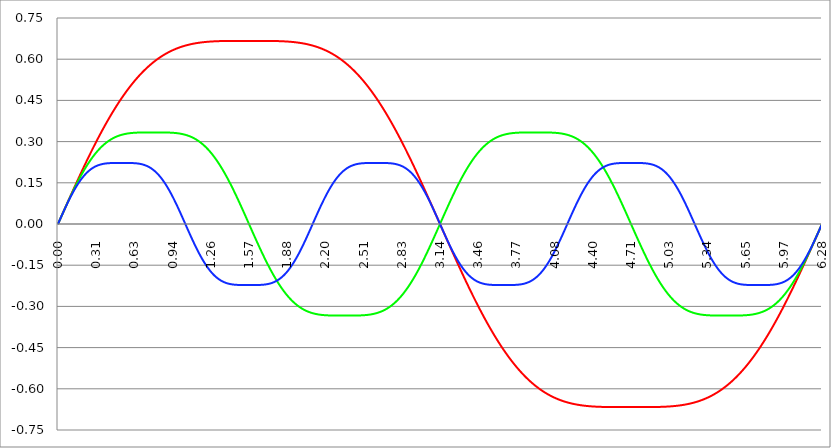
| Category | Series 1 | Series 0 | Series 2 |
|---|---|---|---|
| 0.0 | 0 | 0 | 0 |
| 0.00314159265358979 | 0.003 | 0.003 | 0.003 |
| 0.00628318530717958 | 0.006 | 0.006 | 0.006 |
| 0.00942477796076938 | 0.009 | 0.009 | 0.009 |
| 0.0125663706143592 | 0.013 | 0.013 | 0.013 |
| 0.015707963267949 | 0.016 | 0.016 | 0.016 |
| 0.0188495559215388 | 0.019 | 0.019 | 0.019 |
| 0.0219911485751285 | 0.022 | 0.022 | 0.022 |
| 0.0251327412287183 | 0.025 | 0.025 | 0.025 |
| 0.0282743338823081 | 0.028 | 0.028 | 0.028 |
| 0.0314159265358979 | 0.031 | 0.031 | 0.031 |
| 0.0345575191894877 | 0.035 | 0.034 | 0.034 |
| 0.0376991118430775 | 0.038 | 0.038 | 0.037 |
| 0.0408407044966673 | 0.041 | 0.041 | 0.041 |
| 0.0439822971502571 | 0.044 | 0.044 | 0.044 |
| 0.0471238898038469 | 0.047 | 0.047 | 0.047 |
| 0.0502654824574367 | 0.05 | 0.05 | 0.05 |
| 0.0534070751110265 | 0.053 | 0.053 | 0.053 |
| 0.0565486677646163 | 0.056 | 0.056 | 0.056 |
| 0.059690260418206 | 0.06 | 0.059 | 0.059 |
| 0.0628318530717958 | 0.063 | 0.062 | 0.062 |
| 0.0659734457253856 | 0.066 | 0.065 | 0.065 |
| 0.0691150383789754 | 0.069 | 0.068 | 0.068 |
| 0.0722566310325652 | 0.072 | 0.072 | 0.071 |
| 0.075398223686155 | 0.075 | 0.075 | 0.074 |
| 0.0785398163397448 | 0.078 | 0.078 | 0.076 |
| 0.0816814089933346 | 0.081 | 0.081 | 0.079 |
| 0.0848230016469244 | 0.085 | 0.084 | 0.082 |
| 0.0879645943005142 | 0.088 | 0.087 | 0.085 |
| 0.091106186954104 | 0.091 | 0.09 | 0.088 |
| 0.0942477796076937 | 0.094 | 0.093 | 0.091 |
| 0.0973893722612835 | 0.097 | 0.096 | 0.093 |
| 0.100530964914873 | 0.1 | 0.099 | 0.096 |
| 0.103672557568463 | 0.103 | 0.101 | 0.099 |
| 0.106814150222053 | 0.106 | 0.104 | 0.102 |
| 0.109955742875643 | 0.109 | 0.107 | 0.104 |
| 0.113097335529233 | 0.112 | 0.11 | 0.107 |
| 0.116238928182822 | 0.115 | 0.113 | 0.109 |
| 0.119380520836412 | 0.119 | 0.116 | 0.112 |
| 0.122522113490002 | 0.122 | 0.119 | 0.115 |
| 0.125663706143592 | 0.125 | 0.122 | 0.117 |
| 0.128805298797181 | 0.128 | 0.125 | 0.12 |
| 0.131946891450771 | 0.131 | 0.127 | 0.122 |
| 0.135088484104361 | 0.134 | 0.13 | 0.125 |
| 0.138230076757951 | 0.137 | 0.133 | 0.127 |
| 0.141371669411541 | 0.14 | 0.136 | 0.129 |
| 0.14451326206513 | 0.143 | 0.139 | 0.132 |
| 0.14765485471872 | 0.146 | 0.141 | 0.134 |
| 0.15079644737231 | 0.149 | 0.144 | 0.136 |
| 0.1539380400259 | 0.152 | 0.147 | 0.139 |
| 0.15707963267949 | 0.155 | 0.15 | 0.141 |
| 0.160221225333079 | 0.158 | 0.152 | 0.143 |
| 0.163362817986669 | 0.161 | 0.155 | 0.145 |
| 0.166504410640259 | 0.164 | 0.158 | 0.147 |
| 0.169646003293849 | 0.167 | 0.16 | 0.15 |
| 0.172787595947439 | 0.17 | 0.163 | 0.152 |
| 0.175929188601028 | 0.173 | 0.165 | 0.154 |
| 0.179070781254618 | 0.176 | 0.168 | 0.156 |
| 0.182212373908208 | 0.179 | 0.171 | 0.158 |
| 0.185353966561798 | 0.182 | 0.173 | 0.16 |
| 0.188495559215388 | 0.185 | 0.176 | 0.162 |
| 0.191637151868977 | 0.188 | 0.178 | 0.163 |
| 0.194778744522567 | 0.191 | 0.181 | 0.165 |
| 0.197920337176157 | 0.194 | 0.183 | 0.167 |
| 0.201061929829747 | 0.197 | 0.186 | 0.169 |
| 0.204203522483336 | 0.2 | 0.188 | 0.171 |
| 0.207345115136926 | 0.203 | 0.191 | 0.172 |
| 0.210486707790516 | 0.206 | 0.193 | 0.174 |
| 0.213628300444106 | 0.209 | 0.195 | 0.176 |
| 0.216769893097696 | 0.212 | 0.198 | 0.177 |
| 0.219911485751285 | 0.215 | 0.2 | 0.179 |
| 0.223053078404875 | 0.218 | 0.202 | 0.18 |
| 0.226194671058465 | 0.221 | 0.205 | 0.182 |
| 0.229336263712055 | 0.223 | 0.207 | 0.183 |
| 0.232477856365645 | 0.226 | 0.209 | 0.185 |
| 0.235619449019234 | 0.229 | 0.211 | 0.186 |
| 0.238761041672824 | 0.232 | 0.214 | 0.187 |
| 0.241902634326414 | 0.235 | 0.216 | 0.189 |
| 0.245044226980004 | 0.238 | 0.218 | 0.19 |
| 0.248185819633594 | 0.241 | 0.22 | 0.191 |
| 0.251327412287183 | 0.244 | 0.222 | 0.193 |
| 0.254469004940773 | 0.246 | 0.224 | 0.194 |
| 0.257610597594363 | 0.249 | 0.226 | 0.195 |
| 0.260752190247953 | 0.252 | 0.228 | 0.196 |
| 0.263893782901543 | 0.255 | 0.231 | 0.197 |
| 0.267035375555132 | 0.258 | 0.233 | 0.198 |
| 0.270176968208722 | 0.261 | 0.235 | 0.199 |
| 0.273318560862312 | 0.263 | 0.236 | 0.2 |
| 0.276460153515902 | 0.266 | 0.238 | 0.201 |
| 0.279601746169492 | 0.269 | 0.24 | 0.202 |
| 0.282743338823082 | 0.272 | 0.242 | 0.203 |
| 0.285884931476671 | 0.275 | 0.244 | 0.204 |
| 0.289026524130261 | 0.277 | 0.246 | 0.205 |
| 0.292168116783851 | 0.28 | 0.248 | 0.206 |
| 0.295309709437441 | 0.283 | 0.25 | 0.207 |
| 0.298451302091031 | 0.286 | 0.251 | 0.207 |
| 0.30159289474462 | 0.288 | 0.253 | 0.208 |
| 0.30473448739821 | 0.291 | 0.255 | 0.209 |
| 0.3078760800518 | 0.294 | 0.257 | 0.21 |
| 0.31101767270539 | 0.296 | 0.258 | 0.21 |
| 0.31415926535898 | 0.299 | 0.26 | 0.211 |
| 0.31730085801257 | 0.302 | 0.262 | 0.211 |
| 0.320442450666159 | 0.305 | 0.263 | 0.212 |
| 0.323584043319749 | 0.307 | 0.265 | 0.213 |
| 0.326725635973339 | 0.31 | 0.267 | 0.213 |
| 0.329867228626929 | 0.313 | 0.268 | 0.214 |
| 0.333008821280519 | 0.315 | 0.27 | 0.214 |
| 0.336150413934108 | 0.318 | 0.271 | 0.215 |
| 0.339292006587698 | 0.321 | 0.273 | 0.215 |
| 0.342433599241288 | 0.323 | 0.274 | 0.216 |
| 0.345575191894878 | 0.326 | 0.276 | 0.216 |
| 0.348716784548468 | 0.328 | 0.277 | 0.216 |
| 0.351858377202058 | 0.331 | 0.278 | 0.217 |
| 0.354999969855647 | 0.334 | 0.28 | 0.217 |
| 0.358141562509237 | 0.336 | 0.281 | 0.218 |
| 0.361283155162827 | 0.339 | 0.282 | 0.218 |
| 0.364424747816417 | 0.341 | 0.284 | 0.218 |
| 0.367566340470007 | 0.344 | 0.285 | 0.219 |
| 0.370707933123597 | 0.346 | 0.286 | 0.219 |
| 0.373849525777186 | 0.349 | 0.288 | 0.219 |
| 0.376991118430776 | 0.351 | 0.289 | 0.219 |
| 0.380132711084366 | 0.354 | 0.29 | 0.22 |
| 0.383274303737956 | 0.357 | 0.291 | 0.22 |
| 0.386415896391546 | 0.359 | 0.292 | 0.22 |
| 0.389557489045135 | 0.362 | 0.294 | 0.22 |
| 0.392699081698725 | 0.364 | 0.295 | 0.22 |
| 0.395840674352315 | 0.366 | 0.296 | 0.221 |
| 0.398982267005905 | 0.369 | 0.297 | 0.221 |
| 0.402123859659495 | 0.371 | 0.298 | 0.221 |
| 0.405265452313085 | 0.374 | 0.299 | 0.221 |
| 0.408407044966674 | 0.376 | 0.3 | 0.221 |
| 0.411548637620264 | 0.379 | 0.301 | 0.221 |
| 0.414690230273854 | 0.381 | 0.302 | 0.221 |
| 0.417831822927444 | 0.384 | 0.303 | 0.221 |
| 0.420973415581034 | 0.386 | 0.304 | 0.221 |
| 0.424115008234623 | 0.388 | 0.305 | 0.222 |
| 0.427256600888213 | 0.391 | 0.306 | 0.222 |
| 0.430398193541803 | 0.393 | 0.306 | 0.222 |
| 0.433539786195393 | 0.395 | 0.307 | 0.222 |
| 0.436681378848983 | 0.398 | 0.308 | 0.222 |
| 0.439822971502573 | 0.4 | 0.309 | 0.222 |
| 0.442964564156162 | 0.402 | 0.31 | 0.222 |
| 0.446106156809752 | 0.405 | 0.311 | 0.222 |
| 0.449247749463342 | 0.407 | 0.311 | 0.222 |
| 0.452389342116932 | 0.409 | 0.312 | 0.222 |
| 0.455530934770522 | 0.412 | 0.313 | 0.222 |
| 0.458672527424111 | 0.414 | 0.314 | 0.222 |
| 0.461814120077701 | 0.416 | 0.314 | 0.222 |
| 0.464955712731291 | 0.418 | 0.315 | 0.222 |
| 0.468097305384881 | 0.421 | 0.316 | 0.222 |
| 0.471238898038471 | 0.423 | 0.316 | 0.222 |
| 0.474380490692061 | 0.425 | 0.317 | 0.222 |
| 0.47752208334565 | 0.427 | 0.318 | 0.222 |
| 0.48066367599924 | 0.429 | 0.318 | 0.222 |
| 0.48380526865283 | 0.432 | 0.319 | 0.222 |
| 0.48694686130642 | 0.434 | 0.319 | 0.222 |
| 0.49008845396001 | 0.436 | 0.32 | 0.222 |
| 0.493230046613599 | 0.438 | 0.32 | 0.222 |
| 0.496371639267189 | 0.44 | 0.321 | 0.222 |
| 0.499513231920779 | 0.442 | 0.321 | 0.222 |
| 0.502654824574369 | 0.444 | 0.322 | 0.222 |
| 0.505796417227959 | 0.447 | 0.322 | 0.222 |
| 0.508938009881549 | 0.449 | 0.323 | 0.222 |
| 0.512079602535138 | 0.451 | 0.323 | 0.222 |
| 0.515221195188728 | 0.453 | 0.324 | 0.222 |
| 0.518362787842318 | 0.455 | 0.324 | 0.222 |
| 0.521504380495908 | 0.457 | 0.324 | 0.222 |
| 0.524645973149498 | 0.459 | 0.325 | 0.222 |
| 0.527787565803087 | 0.461 | 0.325 | 0.222 |
| 0.530929158456677 | 0.463 | 0.326 | 0.222 |
| 0.534070751110267 | 0.465 | 0.326 | 0.222 |
| 0.537212343763857 | 0.467 | 0.326 | 0.222 |
| 0.540353936417447 | 0.469 | 0.327 | 0.222 |
| 0.543495529071037 | 0.471 | 0.327 | 0.222 |
| 0.546637121724626 | 0.473 | 0.327 | 0.222 |
| 0.549778714378216 | 0.475 | 0.328 | 0.222 |
| 0.552920307031806 | 0.477 | 0.328 | 0.222 |
| 0.556061899685396 | 0.479 | 0.328 | 0.222 |
| 0.559203492338986 | 0.481 | 0.328 | 0.222 |
| 0.562345084992576 | 0.483 | 0.329 | 0.222 |
| 0.565486677646165 | 0.485 | 0.329 | 0.222 |
| 0.568628270299755 | 0.486 | 0.329 | 0.222 |
| 0.571769862953345 | 0.488 | 0.329 | 0.222 |
| 0.574911455606935 | 0.49 | 0.33 | 0.222 |
| 0.578053048260525 | 0.492 | 0.33 | 0.222 |
| 0.581194640914114 | 0.494 | 0.33 | 0.222 |
| 0.584336233567704 | 0.496 | 0.33 | 0.222 |
| 0.587477826221294 | 0.498 | 0.33 | 0.222 |
| 0.590619418874884 | 0.499 | 0.331 | 0.222 |
| 0.593761011528474 | 0.501 | 0.331 | 0.222 |
| 0.596902604182064 | 0.503 | 0.331 | 0.222 |
| 0.600044196835653 | 0.505 | 0.331 | 0.222 |
| 0.603185789489243 | 0.506 | 0.331 | 0.222 |
| 0.606327382142833 | 0.508 | 0.331 | 0.222 |
| 0.609468974796423 | 0.51 | 0.331 | 0.222 |
| 0.612610567450013 | 0.512 | 0.332 | 0.222 |
| 0.615752160103602 | 0.513 | 0.332 | 0.222 |
| 0.618893752757192 | 0.515 | 0.332 | 0.222 |
| 0.622035345410782 | 0.517 | 0.332 | 0.222 |
| 0.625176938064372 | 0.518 | 0.332 | 0.222 |
| 0.628318530717962 | 0.52 | 0.332 | 0.221 |
| 0.631460123371551 | 0.522 | 0.332 | 0.221 |
| 0.634601716025141 | 0.523 | 0.332 | 0.221 |
| 0.637743308678731 | 0.525 | 0.332 | 0.221 |
| 0.640884901332321 | 0.527 | 0.332 | 0.221 |
| 0.644026493985911 | 0.528 | 0.333 | 0.221 |
| 0.647168086639501 | 0.53 | 0.333 | 0.221 |
| 0.65030967929309 | 0.531 | 0.333 | 0.221 |
| 0.65345127194668 | 0.533 | 0.333 | 0.22 |
| 0.65659286460027 | 0.535 | 0.333 | 0.22 |
| 0.65973445725386 | 0.536 | 0.333 | 0.22 |
| 0.66287604990745 | 0.538 | 0.333 | 0.22 |
| 0.666017642561039 | 0.539 | 0.333 | 0.22 |
| 0.669159235214629 | 0.541 | 0.333 | 0.219 |
| 0.672300827868219 | 0.542 | 0.333 | 0.219 |
| 0.675442420521809 | 0.544 | 0.333 | 0.219 |
| 0.678584013175399 | 0.545 | 0.333 | 0.219 |
| 0.681725605828989 | 0.547 | 0.333 | 0.218 |
| 0.684867198482578 | 0.548 | 0.333 | 0.218 |
| 0.688008791136168 | 0.55 | 0.333 | 0.218 |
| 0.691150383789758 | 0.551 | 0.333 | 0.217 |
| 0.694291976443348 | 0.553 | 0.333 | 0.217 |
| 0.697433569096938 | 0.554 | 0.333 | 0.217 |
| 0.700575161750528 | 0.555 | 0.333 | 0.216 |
| 0.703716754404117 | 0.557 | 0.333 | 0.216 |
| 0.706858347057707 | 0.558 | 0.333 | 0.215 |
| 0.709999939711297 | 0.56 | 0.333 | 0.215 |
| 0.713141532364887 | 0.561 | 0.333 | 0.214 |
| 0.716283125018477 | 0.562 | 0.333 | 0.214 |
| 0.719424717672066 | 0.564 | 0.333 | 0.213 |
| 0.722566310325656 | 0.565 | 0.333 | 0.213 |
| 0.725707902979246 | 0.566 | 0.333 | 0.212 |
| 0.728849495632836 | 0.568 | 0.333 | 0.212 |
| 0.731991088286426 | 0.569 | 0.333 | 0.211 |
| 0.735132680940016 | 0.57 | 0.333 | 0.21 |
| 0.738274273593605 | 0.571 | 0.333 | 0.21 |
| 0.741415866247195 | 0.573 | 0.333 | 0.209 |
| 0.744557458900785 | 0.574 | 0.333 | 0.208 |
| 0.747699051554375 | 0.575 | 0.333 | 0.208 |
| 0.750840644207965 | 0.576 | 0.333 | 0.207 |
| 0.753982236861554 | 0.578 | 0.333 | 0.206 |
| 0.757123829515144 | 0.579 | 0.333 | 0.205 |
| 0.760265422168734 | 0.58 | 0.333 | 0.204 |
| 0.763407014822324 | 0.581 | 0.333 | 0.203 |
| 0.766548607475914 | 0.582 | 0.333 | 0.203 |
| 0.769690200129504 | 0.584 | 0.333 | 0.202 |
| 0.772831792783093 | 0.585 | 0.333 | 0.201 |
| 0.775973385436683 | 0.586 | 0.333 | 0.2 |
| 0.779114978090273 | 0.587 | 0.333 | 0.199 |
| 0.782256570743863 | 0.588 | 0.333 | 0.198 |
| 0.785398163397453 | 0.589 | 0.333 | 0.196 |
| 0.788539756051042 | 0.59 | 0.333 | 0.195 |
| 0.791681348704632 | 0.591 | 0.333 | 0.194 |
| 0.794822941358222 | 0.593 | 0.333 | 0.193 |
| 0.797964534011812 | 0.594 | 0.333 | 0.192 |
| 0.801106126665402 | 0.595 | 0.333 | 0.19 |
| 0.804247719318992 | 0.596 | 0.333 | 0.189 |
| 0.807389311972581 | 0.597 | 0.333 | 0.188 |
| 0.810530904626171 | 0.598 | 0.333 | 0.187 |
| 0.813672497279761 | 0.599 | 0.333 | 0.185 |
| 0.816814089933351 | 0.6 | 0.333 | 0.184 |
| 0.819955682586941 | 0.601 | 0.333 | 0.182 |
| 0.823097275240531 | 0.602 | 0.333 | 0.181 |
| 0.82623886789412 | 0.603 | 0.333 | 0.179 |
| 0.82938046054771 | 0.604 | 0.333 | 0.178 |
| 0.8325220532013 | 0.605 | 0.333 | 0.176 |
| 0.83566364585489 | 0.606 | 0.333 | 0.174 |
| 0.83880523850848 | 0.607 | 0.333 | 0.173 |
| 0.841946831162069 | 0.608 | 0.333 | 0.171 |
| 0.845088423815659 | 0.609 | 0.333 | 0.169 |
| 0.848230016469249 | 0.609 | 0.333 | 0.168 |
| 0.851371609122839 | 0.61 | 0.333 | 0.166 |
| 0.854513201776429 | 0.611 | 0.333 | 0.164 |
| 0.857654794430019 | 0.612 | 0.333 | 0.162 |
| 0.860796387083608 | 0.613 | 0.333 | 0.16 |
| 0.863937979737198 | 0.614 | 0.333 | 0.158 |
| 0.867079572390788 | 0.615 | 0.333 | 0.156 |
| 0.870221165044378 | 0.616 | 0.333 | 0.154 |
| 0.873362757697968 | 0.616 | 0.333 | 0.152 |
| 0.876504350351557 | 0.617 | 0.333 | 0.15 |
| 0.879645943005147 | 0.618 | 0.333 | 0.148 |
| 0.882787535658737 | 0.619 | 0.333 | 0.146 |
| 0.885929128312327 | 0.62 | 0.333 | 0.144 |
| 0.889070720965917 | 0.62 | 0.333 | 0.142 |
| 0.892212313619507 | 0.621 | 0.333 | 0.139 |
| 0.895353906273096 | 0.622 | 0.333 | 0.137 |
| 0.898495498926686 | 0.623 | 0.333 | 0.135 |
| 0.901637091580276 | 0.624 | 0.333 | 0.133 |
| 0.904778684233866 | 0.624 | 0.333 | 0.13 |
| 0.907920276887456 | 0.625 | 0.333 | 0.128 |
| 0.911061869541045 | 0.626 | 0.333 | 0.125 |
| 0.914203462194635 | 0.626 | 0.333 | 0.123 |
| 0.917345054848225 | 0.627 | 0.333 | 0.121 |
| 0.920486647501815 | 0.628 | 0.333 | 0.118 |
| 0.923628240155405 | 0.629 | 0.333 | 0.115 |
| 0.926769832808995 | 0.629 | 0.333 | 0.113 |
| 0.929911425462584 | 0.63 | 0.332 | 0.11 |
| 0.933053018116174 | 0.631 | 0.332 | 0.108 |
| 0.936194610769764 | 0.631 | 0.332 | 0.105 |
| 0.939336203423354 | 0.632 | 0.332 | 0.102 |
| 0.942477796076944 | 0.633 | 0.332 | 0.1 |
| 0.945619388730533 | 0.633 | 0.332 | 0.097 |
| 0.948760981384123 | 0.634 | 0.332 | 0.094 |
| 0.951902574037713 | 0.634 | 0.332 | 0.092 |
| 0.955044166691303 | 0.635 | 0.332 | 0.089 |
| 0.958185759344893 | 0.636 | 0.332 | 0.086 |
| 0.961327351998483 | 0.636 | 0.331 | 0.083 |
| 0.964468944652072 | 0.637 | 0.331 | 0.08 |
| 0.967610537305662 | 0.637 | 0.331 | 0.077 |
| 0.970752129959252 | 0.638 | 0.331 | 0.074 |
| 0.973893722612842 | 0.638 | 0.331 | 0.072 |
| 0.977035315266432 | 0.639 | 0.331 | 0.069 |
| 0.980176907920022 | 0.64 | 0.331 | 0.066 |
| 0.983318500573611 | 0.64 | 0.33 | 0.063 |
| 0.986460093227201 | 0.641 | 0.33 | 0.06 |
| 0.989601685880791 | 0.641 | 0.33 | 0.057 |
| 0.992743278534381 | 0.642 | 0.33 | 0.054 |
| 0.995884871187971 | 0.642 | 0.33 | 0.051 |
| 0.99902646384156 | 0.643 | 0.329 | 0.048 |
| 1.00216805649515 | 0.643 | 0.329 | 0.045 |
| 1.00530964914874 | 0.644 | 0.329 | 0.042 |
| 1.00845124180233 | 0.644 | 0.329 | 0.038 |
| 1.01159283445592 | 0.645 | 0.328 | 0.035 |
| 1.01473442710951 | 0.645 | 0.328 | 0.032 |
| 1.017876019763099 | 0.646 | 0.328 | 0.029 |
| 1.021017612416689 | 0.646 | 0.328 | 0.026 |
| 1.02415920507028 | 0.646 | 0.327 | 0.023 |
| 1.027300797723869 | 0.647 | 0.327 | 0.02 |
| 1.030442390377459 | 0.647 | 0.327 | 0.017 |
| 1.033583983031048 | 0.648 | 0.326 | 0.014 |
| 1.036725575684638 | 0.648 | 0.326 | 0.01 |
| 1.039867168338228 | 0.649 | 0.326 | 0.007 |
| 1.043008760991818 | 0.649 | 0.325 | 0.004 |
| 1.046150353645408 | 0.649 | 0.325 | 0.001 |
| 1.049291946298998 | 0.65 | 0.324 | -0.002 |
| 1.052433538952587 | 0.65 | 0.324 | -0.005 |
| 1.055575131606177 | 0.651 | 0.324 | -0.008 |
| 1.058716724259767 | 0.651 | 0.323 | -0.012 |
| 1.061858316913357 | 0.651 | 0.323 | -0.015 |
| 1.064999909566947 | 0.652 | 0.322 | -0.018 |
| 1.068141502220536 | 0.652 | 0.322 | -0.021 |
| 1.071283094874126 | 0.652 | 0.321 | -0.024 |
| 1.074424687527716 | 0.653 | 0.321 | -0.027 |
| 1.077566280181306 | 0.653 | 0.32 | -0.03 |
| 1.080707872834896 | 0.653 | 0.32 | -0.033 |
| 1.083849465488486 | 0.654 | 0.319 | -0.036 |
| 1.086991058142075 | 0.654 | 0.319 | -0.04 |
| 1.090132650795665 | 0.654 | 0.318 | -0.043 |
| 1.093274243449255 | 0.655 | 0.318 | -0.046 |
| 1.096415836102845 | 0.655 | 0.317 | -0.049 |
| 1.099557428756435 | 0.655 | 0.316 | -0.052 |
| 1.102699021410025 | 0.656 | 0.316 | -0.055 |
| 1.105840614063614 | 0.656 | 0.315 | -0.058 |
| 1.108982206717204 | 0.656 | 0.314 | -0.061 |
| 1.112123799370794 | 0.656 | 0.314 | -0.064 |
| 1.115265392024384 | 0.657 | 0.313 | -0.067 |
| 1.118406984677974 | 0.657 | 0.312 | -0.07 |
| 1.121548577331563 | 0.657 | 0.311 | -0.073 |
| 1.124690169985153 | 0.657 | 0.311 | -0.075 |
| 1.127831762638743 | 0.658 | 0.31 | -0.078 |
| 1.130973355292333 | 0.658 | 0.309 | -0.081 |
| 1.134114947945923 | 0.658 | 0.308 | -0.084 |
| 1.137256540599513 | 0.658 | 0.307 | -0.087 |
| 1.140398133253102 | 0.659 | 0.306 | -0.09 |
| 1.143539725906692 | 0.659 | 0.306 | -0.092 |
| 1.146681318560282 | 0.659 | 0.305 | -0.095 |
| 1.149822911213872 | 0.659 | 0.304 | -0.098 |
| 1.152964503867462 | 0.659 | 0.303 | -0.101 |
| 1.156106096521051 | 0.66 | 0.302 | -0.103 |
| 1.159247689174641 | 0.66 | 0.301 | -0.106 |
| 1.162389281828231 | 0.66 | 0.3 | -0.109 |
| 1.165530874481821 | 0.66 | 0.299 | -0.111 |
| 1.168672467135411 | 0.66 | 0.298 | -0.114 |
| 1.171814059789001 | 0.661 | 0.297 | -0.116 |
| 1.17495565244259 | 0.661 | 0.296 | -0.119 |
| 1.17809724509618 | 0.661 | 0.295 | -0.121 |
| 1.18123883774977 | 0.661 | 0.294 | -0.124 |
| 1.18438043040336 | 0.661 | 0.292 | -0.126 |
| 1.18752202305695 | 0.662 | 0.291 | -0.129 |
| 1.190663615710539 | 0.662 | 0.29 | -0.131 |
| 1.193805208364129 | 0.662 | 0.289 | -0.133 |
| 1.19694680101772 | 0.662 | 0.288 | -0.136 |
| 1.200088393671309 | 0.662 | 0.286 | -0.138 |
| 1.203229986324899 | 0.662 | 0.285 | -0.14 |
| 1.206371578978489 | 0.662 | 0.284 | -0.142 |
| 1.209513171632078 | 0.663 | 0.282 | -0.145 |
| 1.212654764285668 | 0.663 | 0.281 | -0.147 |
| 1.215796356939258 | 0.663 | 0.28 | -0.149 |
| 1.218937949592848 | 0.663 | 0.278 | -0.151 |
| 1.222079542246438 | 0.663 | 0.277 | -0.153 |
| 1.225221134900027 | 0.663 | 0.276 | -0.155 |
| 1.228362727553617 | 0.663 | 0.274 | -0.157 |
| 1.231504320207207 | 0.663 | 0.273 | -0.159 |
| 1.234645912860797 | 0.664 | 0.271 | -0.161 |
| 1.237787505514387 | 0.664 | 0.27 | -0.163 |
| 1.240929098167977 | 0.664 | 0.268 | -0.165 |
| 1.244070690821566 | 0.664 | 0.267 | -0.166 |
| 1.247212283475156 | 0.664 | 0.265 | -0.168 |
| 1.250353876128746 | 0.664 | 0.263 | -0.17 |
| 1.253495468782336 | 0.664 | 0.262 | -0.172 |
| 1.256637061435926 | 0.664 | 0.26 | -0.173 |
| 1.259778654089515 | 0.664 | 0.258 | -0.175 |
| 1.262920246743105 | 0.664 | 0.257 | -0.177 |
| 1.266061839396695 | 0.665 | 0.255 | -0.178 |
| 1.269203432050285 | 0.665 | 0.253 | -0.18 |
| 1.272345024703875 | 0.665 | 0.251 | -0.181 |
| 1.275486617357465 | 0.665 | 0.25 | -0.183 |
| 1.278628210011054 | 0.665 | 0.248 | -0.184 |
| 1.281769802664644 | 0.665 | 0.246 | -0.186 |
| 1.284911395318234 | 0.665 | 0.244 | -0.187 |
| 1.288052987971824 | 0.665 | 0.242 | -0.188 |
| 1.291194580625414 | 0.665 | 0.24 | -0.19 |
| 1.294336173279003 | 0.665 | 0.238 | -0.191 |
| 1.297477765932593 | 0.665 | 0.236 | -0.192 |
| 1.300619358586183 | 0.665 | 0.235 | -0.193 |
| 1.303760951239773 | 0.665 | 0.233 | -0.195 |
| 1.306902543893363 | 0.665 | 0.231 | -0.196 |
| 1.310044136546953 | 0.666 | 0.228 | -0.197 |
| 1.313185729200542 | 0.666 | 0.226 | -0.198 |
| 1.316327321854132 | 0.666 | 0.224 | -0.199 |
| 1.319468914507722 | 0.666 | 0.222 | -0.2 |
| 1.322610507161312 | 0.666 | 0.22 | -0.201 |
| 1.325752099814902 | 0.666 | 0.218 | -0.202 |
| 1.328893692468491 | 0.666 | 0.216 | -0.203 |
| 1.332035285122081 | 0.666 | 0.214 | -0.204 |
| 1.335176877775671 | 0.666 | 0.211 | -0.205 |
| 1.338318470429261 | 0.666 | 0.209 | -0.205 |
| 1.341460063082851 | 0.666 | 0.207 | -0.206 |
| 1.344601655736441 | 0.666 | 0.205 | -0.207 |
| 1.34774324839003 | 0.666 | 0.202 | -0.208 |
| 1.35088484104362 | 0.666 | 0.2 | -0.209 |
| 1.35402643369721 | 0.666 | 0.198 | -0.209 |
| 1.3571680263508 | 0.666 | 0.195 | -0.21 |
| 1.36030961900439 | 0.666 | 0.193 | -0.211 |
| 1.363451211657979 | 0.666 | 0.191 | -0.211 |
| 1.36659280431157 | 0.666 | 0.188 | -0.212 |
| 1.369734396965159 | 0.666 | 0.186 | -0.212 |
| 1.372875989618749 | 0.666 | 0.183 | -0.213 |
| 1.376017582272339 | 0.666 | 0.181 | -0.214 |
| 1.379159174925929 | 0.666 | 0.178 | -0.214 |
| 1.382300767579518 | 0.666 | 0.176 | -0.215 |
| 1.385442360233108 | 0.666 | 0.173 | -0.215 |
| 1.388583952886698 | 0.666 | 0.171 | -0.215 |
| 1.391725545540288 | 0.666 | 0.168 | -0.216 |
| 1.394867138193878 | 0.666 | 0.165 | -0.216 |
| 1.398008730847468 | 0.666 | 0.163 | -0.217 |
| 1.401150323501057 | 0.666 | 0.16 | -0.217 |
| 1.404291916154647 | 0.666 | 0.158 | -0.217 |
| 1.407433508808237 | 0.666 | 0.155 | -0.218 |
| 1.410575101461827 | 0.667 | 0.152 | -0.218 |
| 1.413716694115417 | 0.667 | 0.15 | -0.218 |
| 1.416858286769006 | 0.667 | 0.147 | -0.219 |
| 1.419999879422596 | 0.667 | 0.144 | -0.219 |
| 1.423141472076186 | 0.667 | 0.141 | -0.219 |
| 1.426283064729776 | 0.667 | 0.139 | -0.219 |
| 1.429424657383366 | 0.667 | 0.136 | -0.22 |
| 1.432566250036956 | 0.667 | 0.133 | -0.22 |
| 1.435707842690545 | 0.667 | 0.13 | -0.22 |
| 1.438849435344135 | 0.667 | 0.127 | -0.22 |
| 1.441991027997725 | 0.667 | 0.125 | -0.22 |
| 1.445132620651315 | 0.667 | 0.122 | -0.221 |
| 1.448274213304905 | 0.667 | 0.119 | -0.221 |
| 1.451415805958494 | 0.667 | 0.116 | -0.221 |
| 1.454557398612084 | 0.667 | 0.113 | -0.221 |
| 1.457698991265674 | 0.667 | 0.11 | -0.221 |
| 1.460840583919264 | 0.667 | 0.107 | -0.221 |
| 1.463982176572854 | 0.667 | 0.104 | -0.221 |
| 1.467123769226444 | 0.667 | 0.101 | -0.221 |
| 1.470265361880033 | 0.667 | 0.099 | -0.222 |
| 1.473406954533623 | 0.667 | 0.096 | -0.222 |
| 1.476548547187213 | 0.667 | 0.093 | -0.222 |
| 1.479690139840803 | 0.667 | 0.09 | -0.222 |
| 1.482831732494393 | 0.667 | 0.087 | -0.222 |
| 1.485973325147982 | 0.667 | 0.084 | -0.222 |
| 1.489114917801572 | 0.667 | 0.081 | -0.222 |
| 1.492256510455162 | 0.667 | 0.078 | -0.222 |
| 1.495398103108752 | 0.667 | 0.075 | -0.222 |
| 1.498539695762342 | 0.667 | 0.072 | -0.222 |
| 1.501681288415932 | 0.667 | 0.068 | -0.222 |
| 1.504822881069521 | 0.667 | 0.065 | -0.222 |
| 1.507964473723111 | 0.667 | 0.062 | -0.222 |
| 1.511106066376701 | 0.667 | 0.059 | -0.222 |
| 1.514247659030291 | 0.667 | 0.056 | -0.222 |
| 1.517389251683881 | 0.667 | 0.053 | -0.222 |
| 1.520530844337471 | 0.667 | 0.05 | -0.222 |
| 1.52367243699106 | 0.667 | 0.047 | -0.222 |
| 1.52681402964465 | 0.667 | 0.044 | -0.222 |
| 1.52995562229824 | 0.667 | 0.041 | -0.222 |
| 1.53309721495183 | 0.667 | 0.038 | -0.222 |
| 1.53623880760542 | 0.667 | 0.034 | -0.222 |
| 1.539380400259009 | 0.667 | 0.031 | -0.222 |
| 1.542521992912599 | 0.667 | 0.028 | -0.222 |
| 1.545663585566189 | 0.667 | 0.025 | -0.222 |
| 1.548805178219779 | 0.667 | 0.022 | -0.222 |
| 1.551946770873369 | 0.667 | 0.019 | -0.222 |
| 1.555088363526959 | 0.667 | 0.016 | -0.222 |
| 1.558229956180548 | 0.667 | 0.013 | -0.222 |
| 1.561371548834138 | 0.667 | 0.009 | -0.222 |
| 1.564513141487728 | 0.667 | 0.006 | -0.222 |
| 1.567654734141318 | 0.667 | 0.003 | -0.222 |
| 1.570796326794908 | 0.667 | 0 | -0.222 |
| 1.573937919448497 | 0.667 | -0.003 | -0.222 |
| 1.577079512102087 | 0.667 | -0.006 | -0.222 |
| 1.580221104755677 | 0.667 | -0.009 | -0.222 |
| 1.583362697409267 | 0.667 | -0.013 | -0.222 |
| 1.586504290062857 | 0.667 | -0.016 | -0.222 |
| 1.589645882716447 | 0.667 | -0.019 | -0.222 |
| 1.592787475370036 | 0.667 | -0.022 | -0.222 |
| 1.595929068023626 | 0.667 | -0.025 | -0.222 |
| 1.599070660677216 | 0.667 | -0.028 | -0.222 |
| 1.602212253330806 | 0.667 | -0.031 | -0.222 |
| 1.605353845984396 | 0.667 | -0.034 | -0.222 |
| 1.608495438637985 | 0.667 | -0.038 | -0.222 |
| 1.611637031291575 | 0.667 | -0.041 | -0.222 |
| 1.614778623945165 | 0.667 | -0.044 | -0.222 |
| 1.617920216598755 | 0.667 | -0.047 | -0.222 |
| 1.621061809252345 | 0.667 | -0.05 | -0.222 |
| 1.624203401905935 | 0.667 | -0.053 | -0.222 |
| 1.627344994559524 | 0.667 | -0.056 | -0.222 |
| 1.630486587213114 | 0.667 | -0.059 | -0.222 |
| 1.633628179866704 | 0.667 | -0.062 | -0.222 |
| 1.636769772520294 | 0.667 | -0.065 | -0.222 |
| 1.639911365173884 | 0.667 | -0.068 | -0.222 |
| 1.643052957827473 | 0.667 | -0.072 | -0.222 |
| 1.646194550481063 | 0.667 | -0.075 | -0.222 |
| 1.649336143134653 | 0.667 | -0.078 | -0.222 |
| 1.652477735788243 | 0.667 | -0.081 | -0.222 |
| 1.655619328441833 | 0.667 | -0.084 | -0.222 |
| 1.658760921095423 | 0.667 | -0.087 | -0.222 |
| 1.661902513749012 | 0.667 | -0.09 | -0.222 |
| 1.665044106402602 | 0.667 | -0.093 | -0.222 |
| 1.668185699056192 | 0.667 | -0.096 | -0.222 |
| 1.671327291709782 | 0.667 | -0.099 | -0.222 |
| 1.674468884363372 | 0.667 | -0.101 | -0.221 |
| 1.677610477016961 | 0.667 | -0.104 | -0.221 |
| 1.680752069670551 | 0.667 | -0.107 | -0.221 |
| 1.683893662324141 | 0.667 | -0.11 | -0.221 |
| 1.687035254977731 | 0.667 | -0.113 | -0.221 |
| 1.690176847631321 | 0.667 | -0.116 | -0.221 |
| 1.693318440284911 | 0.667 | -0.119 | -0.221 |
| 1.6964600329385 | 0.667 | -0.122 | -0.221 |
| 1.69960162559209 | 0.667 | -0.125 | -0.22 |
| 1.70274321824568 | 0.667 | -0.127 | -0.22 |
| 1.70588481089927 | 0.667 | -0.13 | -0.22 |
| 1.70902640355286 | 0.667 | -0.133 | -0.22 |
| 1.712167996206449 | 0.667 | -0.136 | -0.22 |
| 1.715309588860039 | 0.667 | -0.139 | -0.219 |
| 1.71845118151363 | 0.667 | -0.141 | -0.219 |
| 1.721592774167219 | 0.667 | -0.144 | -0.219 |
| 1.724734366820809 | 0.667 | -0.147 | -0.219 |
| 1.727875959474399 | 0.667 | -0.15 | -0.218 |
| 1.731017552127988 | 0.667 | -0.152 | -0.218 |
| 1.734159144781578 | 0.666 | -0.155 | -0.218 |
| 1.737300737435168 | 0.666 | -0.158 | -0.217 |
| 1.740442330088758 | 0.666 | -0.16 | -0.217 |
| 1.743583922742348 | 0.666 | -0.163 | -0.217 |
| 1.746725515395937 | 0.666 | -0.165 | -0.216 |
| 1.749867108049527 | 0.666 | -0.168 | -0.216 |
| 1.753008700703117 | 0.666 | -0.171 | -0.215 |
| 1.756150293356707 | 0.666 | -0.173 | -0.215 |
| 1.759291886010297 | 0.666 | -0.176 | -0.215 |
| 1.762433478663887 | 0.666 | -0.178 | -0.214 |
| 1.765575071317476 | 0.666 | -0.181 | -0.214 |
| 1.768716663971066 | 0.666 | -0.183 | -0.213 |
| 1.771858256624656 | 0.666 | -0.186 | -0.212 |
| 1.774999849278246 | 0.666 | -0.188 | -0.212 |
| 1.778141441931836 | 0.666 | -0.191 | -0.211 |
| 1.781283034585426 | 0.666 | -0.193 | -0.211 |
| 1.784424627239015 | 0.666 | -0.195 | -0.21 |
| 1.787566219892605 | 0.666 | -0.198 | -0.209 |
| 1.790707812546195 | 0.666 | -0.2 | -0.209 |
| 1.793849405199785 | 0.666 | -0.202 | -0.208 |
| 1.796990997853375 | 0.666 | -0.205 | -0.207 |
| 1.800132590506964 | 0.666 | -0.207 | -0.206 |
| 1.803274183160554 | 0.666 | -0.209 | -0.205 |
| 1.806415775814144 | 0.666 | -0.211 | -0.205 |
| 1.809557368467734 | 0.666 | -0.214 | -0.204 |
| 1.812698961121324 | 0.666 | -0.216 | -0.203 |
| 1.815840553774914 | 0.666 | -0.218 | -0.202 |
| 1.818982146428503 | 0.666 | -0.22 | -0.201 |
| 1.822123739082093 | 0.666 | -0.222 | -0.2 |
| 1.825265331735683 | 0.666 | -0.224 | -0.199 |
| 1.828406924389273 | 0.666 | -0.226 | -0.198 |
| 1.831548517042863 | 0.666 | -0.228 | -0.197 |
| 1.834690109696452 | 0.665 | -0.231 | -0.196 |
| 1.837831702350042 | 0.665 | -0.233 | -0.195 |
| 1.840973295003632 | 0.665 | -0.235 | -0.193 |
| 1.844114887657222 | 0.665 | -0.236 | -0.192 |
| 1.847256480310812 | 0.665 | -0.238 | -0.191 |
| 1.850398072964402 | 0.665 | -0.24 | -0.19 |
| 1.853539665617991 | 0.665 | -0.242 | -0.188 |
| 1.856681258271581 | 0.665 | -0.244 | -0.187 |
| 1.859822850925171 | 0.665 | -0.246 | -0.186 |
| 1.862964443578761 | 0.665 | -0.248 | -0.184 |
| 1.866106036232351 | 0.665 | -0.25 | -0.183 |
| 1.86924762888594 | 0.665 | -0.251 | -0.181 |
| 1.87238922153953 | 0.665 | -0.253 | -0.18 |
| 1.87553081419312 | 0.665 | -0.255 | -0.178 |
| 1.87867240684671 | 0.664 | -0.257 | -0.177 |
| 1.8818139995003 | 0.664 | -0.258 | -0.175 |
| 1.88495559215389 | 0.664 | -0.26 | -0.173 |
| 1.888097184807479 | 0.664 | -0.262 | -0.172 |
| 1.891238777461069 | 0.664 | -0.263 | -0.17 |
| 1.89438037011466 | 0.664 | -0.265 | -0.168 |
| 1.897521962768249 | 0.664 | -0.267 | -0.166 |
| 1.900663555421839 | 0.664 | -0.268 | -0.165 |
| 1.903805148075429 | 0.664 | -0.27 | -0.163 |
| 1.906946740729018 | 0.664 | -0.271 | -0.161 |
| 1.910088333382608 | 0.663 | -0.273 | -0.159 |
| 1.913229926036198 | 0.663 | -0.274 | -0.157 |
| 1.916371518689788 | 0.663 | -0.276 | -0.155 |
| 1.919513111343378 | 0.663 | -0.277 | -0.153 |
| 1.922654703996967 | 0.663 | -0.278 | -0.151 |
| 1.925796296650557 | 0.663 | -0.28 | -0.149 |
| 1.928937889304147 | 0.663 | -0.281 | -0.147 |
| 1.932079481957737 | 0.663 | -0.282 | -0.145 |
| 1.935221074611327 | 0.662 | -0.284 | -0.142 |
| 1.938362667264917 | 0.662 | -0.285 | -0.14 |
| 1.941504259918506 | 0.662 | -0.286 | -0.138 |
| 1.944645852572096 | 0.662 | -0.288 | -0.136 |
| 1.947787445225686 | 0.662 | -0.289 | -0.133 |
| 1.950929037879276 | 0.662 | -0.29 | -0.131 |
| 1.954070630532866 | 0.662 | -0.291 | -0.129 |
| 1.957212223186455 | 0.661 | -0.292 | -0.126 |
| 1.960353815840045 | 0.661 | -0.294 | -0.124 |
| 1.963495408493635 | 0.661 | -0.295 | -0.121 |
| 1.966637001147225 | 0.661 | -0.296 | -0.119 |
| 1.969778593800815 | 0.661 | -0.297 | -0.116 |
| 1.972920186454405 | 0.66 | -0.298 | -0.114 |
| 1.976061779107994 | 0.66 | -0.299 | -0.111 |
| 1.979203371761584 | 0.66 | -0.3 | -0.109 |
| 1.982344964415174 | 0.66 | -0.301 | -0.106 |
| 1.985486557068764 | 0.66 | -0.302 | -0.103 |
| 1.988628149722354 | 0.659 | -0.303 | -0.101 |
| 1.991769742375943 | 0.659 | -0.304 | -0.098 |
| 1.994911335029533 | 0.659 | -0.305 | -0.095 |
| 1.998052927683123 | 0.659 | -0.306 | -0.092 |
| 2.001194520336712 | 0.659 | -0.306 | -0.09 |
| 2.004336112990302 | 0.658 | -0.307 | -0.087 |
| 2.007477705643892 | 0.658 | -0.308 | -0.084 |
| 2.010619298297482 | 0.658 | -0.309 | -0.081 |
| 2.013760890951071 | 0.658 | -0.31 | -0.078 |
| 2.016902483604661 | 0.657 | -0.311 | -0.075 |
| 2.02004407625825 | 0.657 | -0.311 | -0.073 |
| 2.02318566891184 | 0.657 | -0.312 | -0.07 |
| 2.02632726156543 | 0.657 | -0.313 | -0.067 |
| 2.029468854219019 | 0.656 | -0.314 | -0.064 |
| 2.032610446872609 | 0.656 | -0.314 | -0.061 |
| 2.035752039526198 | 0.656 | -0.315 | -0.058 |
| 2.038893632179788 | 0.656 | -0.316 | -0.055 |
| 2.042035224833378 | 0.655 | -0.316 | -0.052 |
| 2.045176817486967 | 0.655 | -0.317 | -0.049 |
| 2.048318410140557 | 0.655 | -0.318 | -0.046 |
| 2.051460002794146 | 0.654 | -0.318 | -0.043 |
| 2.054601595447736 | 0.654 | -0.319 | -0.04 |
| 2.057743188101325 | 0.654 | -0.319 | -0.036 |
| 2.060884780754915 | 0.653 | -0.32 | -0.033 |
| 2.064026373408505 | 0.653 | -0.32 | -0.03 |
| 2.067167966062094 | 0.653 | -0.321 | -0.027 |
| 2.070309558715684 | 0.652 | -0.321 | -0.024 |
| 2.073451151369273 | 0.652 | -0.322 | -0.021 |
| 2.076592744022863 | 0.652 | -0.322 | -0.018 |
| 2.079734336676452 | 0.651 | -0.323 | -0.015 |
| 2.082875929330042 | 0.651 | -0.323 | -0.012 |
| 2.086017521983632 | 0.651 | -0.324 | -0.008 |
| 2.089159114637221 | 0.65 | -0.324 | -0.005 |
| 2.092300707290811 | 0.65 | -0.324 | -0.002 |
| 2.095442299944401 | 0.649 | -0.325 | 0.001 |
| 2.09858389259799 | 0.649 | -0.325 | 0.004 |
| 2.10172548525158 | 0.649 | -0.326 | 0.007 |
| 2.104867077905169 | 0.648 | -0.326 | 0.01 |
| 2.108008670558759 | 0.648 | -0.326 | 0.014 |
| 2.111150263212349 | 0.647 | -0.327 | 0.017 |
| 2.114291855865938 | 0.647 | -0.327 | 0.02 |
| 2.117433448519528 | 0.646 | -0.327 | 0.023 |
| 2.120575041173117 | 0.646 | -0.328 | 0.026 |
| 2.123716633826707 | 0.646 | -0.328 | 0.029 |
| 2.126858226480297 | 0.645 | -0.328 | 0.032 |
| 2.129999819133886 | 0.645 | -0.328 | 0.035 |
| 2.133141411787476 | 0.644 | -0.329 | 0.038 |
| 2.136283004441065 | 0.644 | -0.329 | 0.042 |
| 2.139424597094655 | 0.643 | -0.329 | 0.045 |
| 2.142566189748245 | 0.643 | -0.329 | 0.048 |
| 2.145707782401834 | 0.642 | -0.33 | 0.051 |
| 2.148849375055424 | 0.642 | -0.33 | 0.054 |
| 2.151990967709013 | 0.641 | -0.33 | 0.057 |
| 2.155132560362603 | 0.641 | -0.33 | 0.06 |
| 2.158274153016193 | 0.64 | -0.33 | 0.063 |
| 2.161415745669782 | 0.64 | -0.331 | 0.066 |
| 2.164557338323372 | 0.639 | -0.331 | 0.069 |
| 2.167698930976961 | 0.638 | -0.331 | 0.072 |
| 2.170840523630551 | 0.638 | -0.331 | 0.074 |
| 2.173982116284141 | 0.637 | -0.331 | 0.077 |
| 2.17712370893773 | 0.637 | -0.331 | 0.08 |
| 2.18026530159132 | 0.636 | -0.331 | 0.083 |
| 2.183406894244909 | 0.636 | -0.332 | 0.086 |
| 2.186548486898499 | 0.635 | -0.332 | 0.089 |
| 2.189690079552089 | 0.634 | -0.332 | 0.092 |
| 2.192831672205678 | 0.634 | -0.332 | 0.094 |
| 2.195973264859268 | 0.633 | -0.332 | 0.097 |
| 2.199114857512857 | 0.633 | -0.332 | 0.1 |
| 2.202256450166447 | 0.632 | -0.332 | 0.102 |
| 2.205398042820036 | 0.631 | -0.332 | 0.105 |
| 2.208539635473626 | 0.631 | -0.332 | 0.108 |
| 2.211681228127216 | 0.63 | -0.332 | 0.11 |
| 2.214822820780805 | 0.629 | -0.333 | 0.113 |
| 2.217964413434395 | 0.629 | -0.333 | 0.115 |
| 2.221106006087984 | 0.628 | -0.333 | 0.118 |
| 2.224247598741574 | 0.627 | -0.333 | 0.121 |
| 2.227389191395164 | 0.626 | -0.333 | 0.123 |
| 2.230530784048753 | 0.626 | -0.333 | 0.125 |
| 2.233672376702343 | 0.625 | -0.333 | 0.128 |
| 2.236813969355933 | 0.624 | -0.333 | 0.13 |
| 2.239955562009522 | 0.624 | -0.333 | 0.133 |
| 2.243097154663112 | 0.623 | -0.333 | 0.135 |
| 2.246238747316701 | 0.622 | -0.333 | 0.137 |
| 2.249380339970291 | 0.621 | -0.333 | 0.139 |
| 2.252521932623881 | 0.62 | -0.333 | 0.142 |
| 2.25566352527747 | 0.62 | -0.333 | 0.144 |
| 2.25880511793106 | 0.619 | -0.333 | 0.146 |
| 2.261946710584649 | 0.618 | -0.333 | 0.148 |
| 2.265088303238239 | 0.617 | -0.333 | 0.15 |
| 2.268229895891829 | 0.616 | -0.333 | 0.152 |
| 2.271371488545418 | 0.616 | -0.333 | 0.154 |
| 2.274513081199008 | 0.615 | -0.333 | 0.156 |
| 2.277654673852597 | 0.614 | -0.333 | 0.158 |
| 2.280796266506186 | 0.613 | -0.333 | 0.16 |
| 2.283937859159776 | 0.612 | -0.333 | 0.162 |
| 2.287079451813366 | 0.611 | -0.333 | 0.164 |
| 2.290221044466955 | 0.61 | -0.333 | 0.166 |
| 2.293362637120545 | 0.609 | -0.333 | 0.168 |
| 2.296504229774135 | 0.609 | -0.333 | 0.169 |
| 2.299645822427724 | 0.608 | -0.333 | 0.171 |
| 2.302787415081314 | 0.607 | -0.333 | 0.173 |
| 2.305929007734904 | 0.606 | -0.333 | 0.174 |
| 2.309070600388493 | 0.605 | -0.333 | 0.176 |
| 2.312212193042083 | 0.604 | -0.333 | 0.178 |
| 2.315353785695672 | 0.603 | -0.333 | 0.179 |
| 2.318495378349262 | 0.602 | -0.333 | 0.181 |
| 2.321636971002852 | 0.601 | -0.333 | 0.182 |
| 2.324778563656441 | 0.6 | -0.333 | 0.184 |
| 2.327920156310031 | 0.599 | -0.333 | 0.185 |
| 2.33106174896362 | 0.598 | -0.333 | 0.187 |
| 2.33420334161721 | 0.597 | -0.333 | 0.188 |
| 2.3373449342708 | 0.596 | -0.333 | 0.189 |
| 2.340486526924389 | 0.595 | -0.333 | 0.19 |
| 2.343628119577979 | 0.594 | -0.333 | 0.192 |
| 2.346769712231568 | 0.593 | -0.333 | 0.193 |
| 2.349911304885158 | 0.591 | -0.333 | 0.194 |
| 2.353052897538748 | 0.59 | -0.333 | 0.195 |
| 2.356194490192337 | 0.589 | -0.333 | 0.196 |
| 2.359336082845927 | 0.588 | -0.333 | 0.198 |
| 2.362477675499516 | 0.587 | -0.333 | 0.199 |
| 2.365619268153106 | 0.586 | -0.333 | 0.2 |
| 2.368760860806696 | 0.585 | -0.333 | 0.201 |
| 2.371902453460285 | 0.584 | -0.333 | 0.202 |
| 2.375044046113875 | 0.582 | -0.333 | 0.203 |
| 2.378185638767464 | 0.581 | -0.333 | 0.203 |
| 2.381327231421054 | 0.58 | -0.333 | 0.204 |
| 2.384468824074644 | 0.579 | -0.333 | 0.205 |
| 2.387610416728233 | 0.578 | -0.333 | 0.206 |
| 2.390752009381823 | 0.576 | -0.333 | 0.207 |
| 2.393893602035412 | 0.575 | -0.333 | 0.208 |
| 2.397035194689002 | 0.574 | -0.333 | 0.208 |
| 2.400176787342591 | 0.573 | -0.333 | 0.209 |
| 2.403318379996181 | 0.571 | -0.333 | 0.21 |
| 2.406459972649771 | 0.57 | -0.333 | 0.21 |
| 2.40960156530336 | 0.569 | -0.333 | 0.211 |
| 2.41274315795695 | 0.568 | -0.333 | 0.212 |
| 2.41588475061054 | 0.566 | -0.333 | 0.212 |
| 2.419026343264129 | 0.565 | -0.333 | 0.213 |
| 2.422167935917719 | 0.564 | -0.333 | 0.213 |
| 2.425309528571308 | 0.562 | -0.333 | 0.214 |
| 2.428451121224898 | 0.561 | -0.333 | 0.214 |
| 2.431592713878488 | 0.56 | -0.333 | 0.215 |
| 2.434734306532077 | 0.558 | -0.333 | 0.215 |
| 2.437875899185667 | 0.557 | -0.333 | 0.216 |
| 2.441017491839256 | 0.555 | -0.333 | 0.216 |
| 2.444159084492846 | 0.554 | -0.333 | 0.217 |
| 2.447300677146435 | 0.553 | -0.333 | 0.217 |
| 2.450442269800025 | 0.551 | -0.333 | 0.217 |
| 2.453583862453615 | 0.55 | -0.333 | 0.218 |
| 2.456725455107204 | 0.548 | -0.333 | 0.218 |
| 2.459867047760794 | 0.547 | -0.333 | 0.218 |
| 2.463008640414384 | 0.545 | -0.333 | 0.219 |
| 2.466150233067973 | 0.544 | -0.333 | 0.219 |
| 2.469291825721563 | 0.542 | -0.333 | 0.219 |
| 2.472433418375152 | 0.541 | -0.333 | 0.219 |
| 2.475575011028742 | 0.539 | -0.333 | 0.22 |
| 2.478716603682332 | 0.538 | -0.333 | 0.22 |
| 2.481858196335921 | 0.536 | -0.333 | 0.22 |
| 2.48499978898951 | 0.535 | -0.333 | 0.22 |
| 2.4881413816431 | 0.533 | -0.333 | 0.22 |
| 2.49128297429669 | 0.531 | -0.333 | 0.221 |
| 2.49442456695028 | 0.53 | -0.333 | 0.221 |
| 2.497566159603869 | 0.528 | -0.333 | 0.221 |
| 2.500707752257458 | 0.527 | -0.332 | 0.221 |
| 2.503849344911048 | 0.525 | -0.332 | 0.221 |
| 2.506990937564638 | 0.523 | -0.332 | 0.221 |
| 2.510132530218228 | 0.522 | -0.332 | 0.221 |
| 2.513274122871817 | 0.52 | -0.332 | 0.221 |
| 2.516415715525407 | 0.518 | -0.332 | 0.222 |
| 2.519557308178996 | 0.517 | -0.332 | 0.222 |
| 2.522698900832586 | 0.515 | -0.332 | 0.222 |
| 2.525840493486176 | 0.513 | -0.332 | 0.222 |
| 2.528982086139765 | 0.512 | -0.332 | 0.222 |
| 2.532123678793355 | 0.51 | -0.331 | 0.222 |
| 2.535265271446944 | 0.508 | -0.331 | 0.222 |
| 2.538406864100534 | 0.506 | -0.331 | 0.222 |
| 2.541548456754124 | 0.505 | -0.331 | 0.222 |
| 2.544690049407713 | 0.503 | -0.331 | 0.222 |
| 2.547831642061302 | 0.501 | -0.331 | 0.222 |
| 2.550973234714892 | 0.499 | -0.331 | 0.222 |
| 2.554114827368482 | 0.498 | -0.33 | 0.222 |
| 2.557256420022072 | 0.496 | -0.33 | 0.222 |
| 2.560398012675661 | 0.494 | -0.33 | 0.222 |
| 2.563539605329251 | 0.492 | -0.33 | 0.222 |
| 2.56668119798284 | 0.49 | -0.33 | 0.222 |
| 2.56982279063643 | 0.488 | -0.329 | 0.222 |
| 2.57296438329002 | 0.486 | -0.329 | 0.222 |
| 2.576105975943609 | 0.485 | -0.329 | 0.222 |
| 2.579247568597199 | 0.483 | -0.329 | 0.222 |
| 2.582389161250788 | 0.481 | -0.328 | 0.222 |
| 2.585530753904377 | 0.479 | -0.328 | 0.222 |
| 2.588672346557967 | 0.477 | -0.328 | 0.222 |
| 2.591813939211557 | 0.475 | -0.328 | 0.222 |
| 2.594955531865147 | 0.473 | -0.327 | 0.222 |
| 2.598097124518736 | 0.471 | -0.327 | 0.222 |
| 2.601238717172326 | 0.469 | -0.327 | 0.222 |
| 2.604380309825915 | 0.467 | -0.326 | 0.222 |
| 2.607521902479505 | 0.465 | -0.326 | 0.222 |
| 2.610663495133095 | 0.463 | -0.326 | 0.222 |
| 2.613805087786684 | 0.461 | -0.325 | 0.222 |
| 2.616946680440274 | 0.459 | -0.325 | 0.222 |
| 2.620088273093863 | 0.457 | -0.324 | 0.222 |
| 2.623229865747452 | 0.455 | -0.324 | 0.222 |
| 2.626371458401042 | 0.453 | -0.324 | 0.222 |
| 2.629513051054632 | 0.451 | -0.323 | 0.222 |
| 2.632654643708222 | 0.449 | -0.323 | 0.222 |
| 2.635796236361811 | 0.447 | -0.322 | 0.222 |
| 2.638937829015401 | 0.444 | -0.322 | 0.222 |
| 2.642079421668991 | 0.442 | -0.321 | 0.222 |
| 2.64522101432258 | 0.44 | -0.321 | 0.222 |
| 2.64836260697617 | 0.438 | -0.32 | 0.222 |
| 2.651504199629759 | 0.436 | -0.32 | 0.222 |
| 2.654645792283349 | 0.434 | -0.319 | 0.222 |
| 2.657787384936938 | 0.432 | -0.319 | 0.222 |
| 2.660928977590528 | 0.429 | -0.318 | 0.222 |
| 2.664070570244118 | 0.427 | -0.318 | 0.222 |
| 2.667212162897707 | 0.425 | -0.317 | 0.222 |
| 2.670353755551297 | 0.423 | -0.316 | 0.222 |
| 2.673495348204887 | 0.421 | -0.316 | 0.222 |
| 2.676636940858476 | 0.418 | -0.315 | 0.222 |
| 2.679778533512066 | 0.416 | -0.314 | 0.222 |
| 2.682920126165655 | 0.414 | -0.314 | 0.222 |
| 2.686061718819245 | 0.412 | -0.313 | 0.222 |
| 2.689203311472835 | 0.409 | -0.312 | 0.222 |
| 2.692344904126424 | 0.407 | -0.311 | 0.222 |
| 2.695486496780014 | 0.405 | -0.311 | 0.222 |
| 2.698628089433603 | 0.402 | -0.31 | 0.222 |
| 2.701769682087193 | 0.4 | -0.309 | 0.222 |
| 2.704911274740782 | 0.398 | -0.308 | 0.222 |
| 2.708052867394372 | 0.395 | -0.307 | 0.222 |
| 2.711194460047962 | 0.393 | -0.306 | 0.222 |
| 2.714336052701551 | 0.391 | -0.306 | 0.222 |
| 2.717477645355141 | 0.388 | -0.305 | 0.222 |
| 2.720619238008731 | 0.386 | -0.304 | 0.221 |
| 2.72376083066232 | 0.384 | -0.303 | 0.221 |
| 2.72690242331591 | 0.381 | -0.302 | 0.221 |
| 2.730044015969499 | 0.379 | -0.301 | 0.221 |
| 2.733185608623089 | 0.376 | -0.3 | 0.221 |
| 2.736327201276678 | 0.374 | -0.299 | 0.221 |
| 2.739468793930268 | 0.371 | -0.298 | 0.221 |
| 2.742610386583858 | 0.369 | -0.297 | 0.221 |
| 2.745751979237447 | 0.366 | -0.296 | 0.221 |
| 2.748893571891036 | 0.364 | -0.295 | 0.22 |
| 2.752035164544627 | 0.362 | -0.294 | 0.22 |
| 2.755176757198216 | 0.359 | -0.292 | 0.22 |
| 2.758318349851806 | 0.357 | -0.291 | 0.22 |
| 2.761459942505395 | 0.354 | -0.29 | 0.22 |
| 2.764601535158985 | 0.351 | -0.289 | 0.219 |
| 2.767743127812574 | 0.349 | -0.288 | 0.219 |
| 2.770884720466164 | 0.346 | -0.286 | 0.219 |
| 2.774026313119754 | 0.344 | -0.285 | 0.219 |
| 2.777167905773343 | 0.341 | -0.284 | 0.218 |
| 2.780309498426932 | 0.339 | -0.282 | 0.218 |
| 2.783451091080522 | 0.336 | -0.281 | 0.218 |
| 2.786592683734112 | 0.334 | -0.28 | 0.217 |
| 2.789734276387701 | 0.331 | -0.278 | 0.217 |
| 2.792875869041291 | 0.328 | -0.277 | 0.216 |
| 2.796017461694881 | 0.326 | -0.276 | 0.216 |
| 2.79915905434847 | 0.323 | -0.274 | 0.216 |
| 2.80230064700206 | 0.321 | -0.273 | 0.215 |
| 2.80544223965565 | 0.318 | -0.271 | 0.215 |
| 2.808583832309239 | 0.315 | -0.27 | 0.214 |
| 2.811725424962829 | 0.313 | -0.268 | 0.214 |
| 2.814867017616419 | 0.31 | -0.267 | 0.213 |
| 2.818008610270008 | 0.307 | -0.265 | 0.213 |
| 2.821150202923598 | 0.305 | -0.263 | 0.212 |
| 2.824291795577187 | 0.302 | -0.262 | 0.211 |
| 2.827433388230777 | 0.299 | -0.26 | 0.211 |
| 2.830574980884366 | 0.296 | -0.258 | 0.21 |
| 2.833716573537956 | 0.294 | -0.257 | 0.21 |
| 2.836858166191546 | 0.291 | -0.255 | 0.209 |
| 2.839999758845135 | 0.288 | -0.253 | 0.208 |
| 2.843141351498725 | 0.286 | -0.251 | 0.207 |
| 2.846282944152314 | 0.283 | -0.25 | 0.207 |
| 2.849424536805904 | 0.28 | -0.248 | 0.206 |
| 2.852566129459494 | 0.277 | -0.246 | 0.205 |
| 2.855707722113083 | 0.275 | -0.244 | 0.204 |
| 2.858849314766673 | 0.272 | -0.242 | 0.203 |
| 2.861990907420262 | 0.269 | -0.24 | 0.202 |
| 2.865132500073852 | 0.266 | -0.238 | 0.201 |
| 2.868274092727442 | 0.263 | -0.236 | 0.2 |
| 2.871415685381031 | 0.261 | -0.235 | 0.199 |
| 2.874557278034621 | 0.258 | -0.233 | 0.198 |
| 2.87769887068821 | 0.255 | -0.231 | 0.197 |
| 2.8808404633418 | 0.252 | -0.228 | 0.196 |
| 2.88398205599539 | 0.249 | -0.226 | 0.195 |
| 2.88712364864898 | 0.246 | -0.224 | 0.194 |
| 2.890265241302569 | 0.244 | -0.222 | 0.193 |
| 2.893406833956158 | 0.241 | -0.22 | 0.191 |
| 2.896548426609748 | 0.238 | -0.218 | 0.19 |
| 2.899690019263338 | 0.235 | -0.216 | 0.189 |
| 2.902831611916927 | 0.232 | -0.214 | 0.187 |
| 2.905973204570517 | 0.229 | -0.211 | 0.186 |
| 2.909114797224106 | 0.226 | -0.209 | 0.185 |
| 2.912256389877696 | 0.223 | -0.207 | 0.183 |
| 2.915397982531286 | 0.221 | -0.205 | 0.182 |
| 2.918539575184875 | 0.218 | -0.202 | 0.18 |
| 2.921681167838465 | 0.215 | -0.2 | 0.179 |
| 2.924822760492054 | 0.212 | -0.198 | 0.177 |
| 2.927964353145644 | 0.209 | -0.195 | 0.176 |
| 2.931105945799234 | 0.206 | -0.193 | 0.174 |
| 2.934247538452823 | 0.203 | -0.191 | 0.172 |
| 2.937389131106413 | 0.2 | -0.188 | 0.171 |
| 2.940530723760002 | 0.197 | -0.186 | 0.169 |
| 2.943672316413592 | 0.194 | -0.183 | 0.167 |
| 2.946813909067182 | 0.191 | -0.181 | 0.165 |
| 2.949955501720771 | 0.188 | -0.178 | 0.163 |
| 2.953097094374361 | 0.185 | -0.176 | 0.162 |
| 2.95623868702795 | 0.182 | -0.173 | 0.16 |
| 2.95938027968154 | 0.179 | -0.171 | 0.158 |
| 2.96252187233513 | 0.176 | -0.168 | 0.156 |
| 2.965663464988719 | 0.173 | -0.165 | 0.154 |
| 2.968805057642309 | 0.17 | -0.163 | 0.152 |
| 2.971946650295898 | 0.167 | -0.16 | 0.15 |
| 2.975088242949488 | 0.164 | -0.158 | 0.147 |
| 2.978229835603078 | 0.161 | -0.155 | 0.145 |
| 2.981371428256667 | 0.158 | -0.152 | 0.143 |
| 2.984513020910257 | 0.155 | -0.15 | 0.141 |
| 2.987654613563846 | 0.152 | -0.147 | 0.139 |
| 2.990796206217436 | 0.149 | -0.144 | 0.136 |
| 2.993937798871025 | 0.146 | -0.141 | 0.134 |
| 2.997079391524615 | 0.143 | -0.139 | 0.132 |
| 3.000220984178205 | 0.14 | -0.136 | 0.129 |
| 3.003362576831794 | 0.137 | -0.133 | 0.127 |
| 3.006504169485384 | 0.134 | -0.13 | 0.125 |
| 3.009645762138974 | 0.131 | -0.127 | 0.122 |
| 3.012787354792563 | 0.128 | -0.125 | 0.12 |
| 3.015928947446153 | 0.125 | -0.122 | 0.117 |
| 3.019070540099742 | 0.122 | -0.119 | 0.115 |
| 3.022212132753332 | 0.119 | -0.116 | 0.112 |
| 3.025353725406922 | 0.115 | -0.113 | 0.109 |
| 3.028495318060511 | 0.112 | -0.11 | 0.107 |
| 3.031636910714101 | 0.109 | -0.107 | 0.104 |
| 3.03477850336769 | 0.106 | -0.104 | 0.102 |
| 3.03792009602128 | 0.103 | -0.101 | 0.099 |
| 3.04106168867487 | 0.1 | -0.099 | 0.096 |
| 3.04420328132846 | 0.097 | -0.096 | 0.093 |
| 3.047344873982049 | 0.094 | -0.093 | 0.091 |
| 3.050486466635638 | 0.091 | -0.09 | 0.088 |
| 3.053628059289228 | 0.088 | -0.087 | 0.085 |
| 3.056769651942818 | 0.085 | -0.084 | 0.082 |
| 3.059911244596407 | 0.081 | -0.081 | 0.079 |
| 3.063052837249997 | 0.078 | -0.078 | 0.076 |
| 3.066194429903586 | 0.075 | -0.075 | 0.074 |
| 3.069336022557176 | 0.072 | -0.072 | 0.071 |
| 3.072477615210766 | 0.069 | -0.068 | 0.068 |
| 3.075619207864355 | 0.066 | -0.065 | 0.065 |
| 3.078760800517945 | 0.063 | -0.062 | 0.062 |
| 3.081902393171534 | 0.06 | -0.059 | 0.059 |
| 3.085043985825124 | 0.056 | -0.056 | 0.056 |
| 3.088185578478713 | 0.053 | -0.053 | 0.053 |
| 3.091327171132303 | 0.05 | -0.05 | 0.05 |
| 3.094468763785893 | 0.047 | -0.047 | 0.047 |
| 3.097610356439482 | 0.044 | -0.044 | 0.044 |
| 3.100751949093072 | 0.041 | -0.041 | 0.041 |
| 3.103893541746661 | 0.038 | -0.038 | 0.037 |
| 3.107035134400251 | 0.035 | -0.034 | 0.034 |
| 3.110176727053841 | 0.031 | -0.031 | 0.031 |
| 3.11331831970743 | 0.028 | -0.028 | 0.028 |
| 3.11645991236102 | 0.025 | -0.025 | 0.025 |
| 3.11960150501461 | 0.022 | -0.022 | 0.022 |
| 3.122743097668199 | 0.019 | -0.019 | 0.019 |
| 3.125884690321789 | 0.016 | -0.016 | 0.016 |
| 3.129026282975378 | 0.013 | -0.013 | 0.013 |
| 3.132167875628968 | 0.009 | -0.009 | 0.009 |
| 3.135309468282557 | 0.006 | -0.006 | 0.006 |
| 3.138451060936147 | 0.003 | -0.003 | 0.003 |
| 3.141592653589737 | 0 | 0 | 0 |
| 3.144734246243326 | -0.003 | 0.003 | -0.003 |
| 3.147875838896916 | -0.006 | 0.006 | -0.006 |
| 3.151017431550505 | -0.009 | 0.009 | -0.009 |
| 3.154159024204095 | -0.013 | 0.013 | -0.013 |
| 3.157300616857685 | -0.016 | 0.016 | -0.016 |
| 3.160442209511274 | -0.019 | 0.019 | -0.019 |
| 3.163583802164864 | -0.022 | 0.022 | -0.022 |
| 3.166725394818453 | -0.025 | 0.025 | -0.025 |
| 3.169866987472043 | -0.028 | 0.028 | -0.028 |
| 3.173008580125633 | -0.031 | 0.031 | -0.031 |
| 3.176150172779222 | -0.035 | 0.034 | -0.034 |
| 3.179291765432812 | -0.038 | 0.038 | -0.037 |
| 3.182433358086401 | -0.041 | 0.041 | -0.041 |
| 3.185574950739991 | -0.044 | 0.044 | -0.044 |
| 3.188716543393581 | -0.047 | 0.047 | -0.047 |
| 3.19185813604717 | -0.05 | 0.05 | -0.05 |
| 3.19499972870076 | -0.053 | 0.053 | -0.053 |
| 3.198141321354349 | -0.056 | 0.056 | -0.056 |
| 3.20128291400794 | -0.06 | 0.059 | -0.059 |
| 3.204424506661528 | -0.063 | 0.062 | -0.062 |
| 3.207566099315118 | -0.066 | 0.065 | -0.065 |
| 3.210707691968708 | -0.069 | 0.068 | -0.068 |
| 3.213849284622297 | -0.072 | 0.072 | -0.071 |
| 3.216990877275887 | -0.075 | 0.075 | -0.074 |
| 3.220132469929476 | -0.078 | 0.078 | -0.076 |
| 3.223274062583066 | -0.081 | 0.081 | -0.079 |
| 3.226415655236656 | -0.085 | 0.084 | -0.082 |
| 3.229557247890245 | -0.088 | 0.087 | -0.085 |
| 3.232698840543835 | -0.091 | 0.09 | -0.088 |
| 3.235840433197425 | -0.094 | 0.093 | -0.091 |
| 3.238982025851014 | -0.097 | 0.096 | -0.093 |
| 3.242123618504604 | -0.1 | 0.099 | -0.096 |
| 3.245265211158193 | -0.103 | 0.101 | -0.099 |
| 3.248406803811783 | -0.106 | 0.104 | -0.102 |
| 3.251548396465373 | -0.109 | 0.107 | -0.104 |
| 3.254689989118962 | -0.112 | 0.11 | -0.107 |
| 3.257831581772551 | -0.115 | 0.113 | -0.109 |
| 3.260973174426141 | -0.119 | 0.116 | -0.112 |
| 3.26411476707973 | -0.122 | 0.119 | -0.115 |
| 3.267256359733321 | -0.125 | 0.122 | -0.117 |
| 3.27039795238691 | -0.128 | 0.125 | -0.12 |
| 3.2735395450405 | -0.131 | 0.127 | -0.122 |
| 3.276681137694089 | -0.134 | 0.13 | -0.125 |
| 3.279822730347679 | -0.137 | 0.133 | -0.127 |
| 3.282964323001269 | -0.14 | 0.136 | -0.129 |
| 3.286105915654858 | -0.143 | 0.139 | -0.132 |
| 3.289247508308448 | -0.146 | 0.141 | -0.134 |
| 3.292389100962037 | -0.149 | 0.144 | -0.136 |
| 3.295530693615627 | -0.152 | 0.147 | -0.139 |
| 3.298672286269217 | -0.155 | 0.15 | -0.141 |
| 3.301813878922806 | -0.158 | 0.152 | -0.143 |
| 3.304955471576396 | -0.161 | 0.155 | -0.145 |
| 3.308097064229985 | -0.164 | 0.158 | -0.147 |
| 3.311238656883575 | -0.167 | 0.16 | -0.15 |
| 3.314380249537165 | -0.17 | 0.163 | -0.152 |
| 3.317521842190754 | -0.173 | 0.165 | -0.154 |
| 3.320663434844344 | -0.176 | 0.168 | -0.156 |
| 3.323805027497933 | -0.179 | 0.171 | -0.158 |
| 3.326946620151523 | -0.182 | 0.173 | -0.16 |
| 3.330088212805113 | -0.185 | 0.176 | -0.162 |
| 3.333229805458702 | -0.188 | 0.178 | -0.163 |
| 3.336371398112292 | -0.191 | 0.181 | -0.165 |
| 3.339512990765881 | -0.194 | 0.183 | -0.167 |
| 3.342654583419471 | -0.197 | 0.186 | -0.169 |
| 3.345796176073061 | -0.2 | 0.188 | -0.171 |
| 3.34893776872665 | -0.203 | 0.191 | -0.172 |
| 3.35207936138024 | -0.206 | 0.193 | -0.174 |
| 3.355220954033829 | -0.209 | 0.195 | -0.176 |
| 3.358362546687419 | -0.212 | 0.198 | -0.177 |
| 3.361504139341009 | -0.215 | 0.2 | -0.179 |
| 3.364645731994598 | -0.218 | 0.202 | -0.18 |
| 3.367787324648188 | -0.221 | 0.205 | -0.182 |
| 3.370928917301777 | -0.223 | 0.207 | -0.183 |
| 3.374070509955367 | -0.226 | 0.209 | -0.185 |
| 3.377212102608956 | -0.229 | 0.211 | -0.186 |
| 3.380353695262546 | -0.232 | 0.214 | -0.187 |
| 3.383495287916136 | -0.235 | 0.216 | -0.189 |
| 3.386636880569725 | -0.238 | 0.218 | -0.19 |
| 3.389778473223315 | -0.241 | 0.22 | -0.191 |
| 3.392920065876904 | -0.244 | 0.222 | -0.193 |
| 3.396061658530494 | -0.246 | 0.224 | -0.194 |
| 3.399203251184084 | -0.249 | 0.226 | -0.195 |
| 3.402344843837673 | -0.252 | 0.228 | -0.196 |
| 3.405486436491263 | -0.255 | 0.231 | -0.197 |
| 3.408628029144852 | -0.258 | 0.233 | -0.198 |
| 3.411769621798442 | -0.261 | 0.235 | -0.199 |
| 3.414911214452032 | -0.263 | 0.236 | -0.2 |
| 3.418052807105621 | -0.266 | 0.238 | -0.201 |
| 3.421194399759211 | -0.269 | 0.24 | -0.202 |
| 3.4243359924128 | -0.272 | 0.242 | -0.203 |
| 3.42747758506639 | -0.275 | 0.244 | -0.204 |
| 3.43061917771998 | -0.277 | 0.246 | -0.205 |
| 3.433760770373569 | -0.28 | 0.248 | -0.206 |
| 3.436902363027159 | -0.283 | 0.25 | -0.207 |
| 3.440043955680748 | -0.286 | 0.251 | -0.207 |
| 3.443185548334338 | -0.288 | 0.253 | -0.208 |
| 3.446327140987927 | -0.291 | 0.255 | -0.209 |
| 3.449468733641517 | -0.294 | 0.257 | -0.21 |
| 3.452610326295107 | -0.296 | 0.258 | -0.21 |
| 3.455751918948696 | -0.299 | 0.26 | -0.211 |
| 3.458893511602286 | -0.302 | 0.262 | -0.211 |
| 3.462035104255876 | -0.305 | 0.263 | -0.212 |
| 3.465176696909465 | -0.307 | 0.265 | -0.213 |
| 3.468318289563055 | -0.31 | 0.267 | -0.213 |
| 3.471459882216644 | -0.313 | 0.268 | -0.214 |
| 3.474601474870234 | -0.315 | 0.27 | -0.214 |
| 3.477743067523824 | -0.318 | 0.271 | -0.215 |
| 3.480884660177413 | -0.321 | 0.273 | -0.215 |
| 3.484026252831002 | -0.323 | 0.274 | -0.216 |
| 3.487167845484592 | -0.326 | 0.276 | -0.216 |
| 3.490309438138182 | -0.328 | 0.277 | -0.216 |
| 3.493451030791772 | -0.331 | 0.278 | -0.217 |
| 3.496592623445361 | -0.334 | 0.28 | -0.217 |
| 3.499734216098951 | -0.336 | 0.281 | -0.218 |
| 3.50287580875254 | -0.339 | 0.282 | -0.218 |
| 3.50601740140613 | -0.341 | 0.284 | -0.218 |
| 3.50915899405972 | -0.344 | 0.285 | -0.219 |
| 3.512300586713309 | -0.346 | 0.286 | -0.219 |
| 3.515442179366899 | -0.349 | 0.288 | -0.219 |
| 3.518583772020488 | -0.351 | 0.289 | -0.219 |
| 3.521725364674078 | -0.354 | 0.29 | -0.22 |
| 3.524866957327668 | -0.357 | 0.291 | -0.22 |
| 3.528008549981257 | -0.359 | 0.292 | -0.22 |
| 3.531150142634847 | -0.362 | 0.294 | -0.22 |
| 3.534291735288436 | -0.364 | 0.295 | -0.22 |
| 3.537433327942026 | -0.366 | 0.296 | -0.221 |
| 3.540574920595616 | -0.369 | 0.297 | -0.221 |
| 3.543716513249205 | -0.371 | 0.298 | -0.221 |
| 3.546858105902795 | -0.374 | 0.299 | -0.221 |
| 3.549999698556384 | -0.376 | 0.3 | -0.221 |
| 3.553141291209974 | -0.379 | 0.301 | -0.221 |
| 3.556282883863564 | -0.381 | 0.302 | -0.221 |
| 3.559424476517153 | -0.384 | 0.303 | -0.221 |
| 3.562566069170743 | -0.386 | 0.304 | -0.221 |
| 3.565707661824332 | -0.388 | 0.305 | -0.222 |
| 3.568849254477922 | -0.391 | 0.306 | -0.222 |
| 3.571990847131511 | -0.393 | 0.306 | -0.222 |
| 3.575132439785101 | -0.395 | 0.307 | -0.222 |
| 3.578274032438691 | -0.398 | 0.308 | -0.222 |
| 3.58141562509228 | -0.4 | 0.309 | -0.222 |
| 3.58455721774587 | -0.402 | 0.31 | -0.222 |
| 3.58769881039946 | -0.405 | 0.311 | -0.222 |
| 3.590840403053049 | -0.407 | 0.311 | -0.222 |
| 3.593981995706639 | -0.409 | 0.312 | -0.222 |
| 3.597123588360228 | -0.412 | 0.313 | -0.222 |
| 3.600265181013818 | -0.414 | 0.314 | -0.222 |
| 3.603406773667407 | -0.416 | 0.314 | -0.222 |
| 3.606548366320997 | -0.418 | 0.315 | -0.222 |
| 3.609689958974587 | -0.421 | 0.316 | -0.222 |
| 3.612831551628176 | -0.423 | 0.316 | -0.222 |
| 3.615973144281766 | -0.425 | 0.317 | -0.222 |
| 3.619114736935355 | -0.427 | 0.318 | -0.222 |
| 3.622256329588945 | -0.429 | 0.318 | -0.222 |
| 3.625397922242534 | -0.432 | 0.319 | -0.222 |
| 3.628539514896124 | -0.434 | 0.319 | -0.222 |
| 3.631681107549714 | -0.436 | 0.32 | -0.222 |
| 3.634822700203303 | -0.438 | 0.32 | -0.222 |
| 3.637964292856893 | -0.44 | 0.321 | -0.222 |
| 3.641105885510483 | -0.442 | 0.321 | -0.222 |
| 3.644247478164072 | -0.444 | 0.322 | -0.222 |
| 3.647389070817662 | -0.447 | 0.322 | -0.222 |
| 3.650530663471251 | -0.449 | 0.323 | -0.222 |
| 3.653672256124841 | -0.451 | 0.323 | -0.222 |
| 3.656813848778431 | -0.453 | 0.324 | -0.222 |
| 3.65995544143202 | -0.455 | 0.324 | -0.222 |
| 3.66309703408561 | -0.457 | 0.324 | -0.222 |
| 3.666238626739199 | -0.459 | 0.325 | -0.222 |
| 3.66938021939279 | -0.461 | 0.325 | -0.222 |
| 3.672521812046378 | -0.463 | 0.326 | -0.222 |
| 3.675663404699968 | -0.465 | 0.326 | -0.222 |
| 3.678804997353558 | -0.467 | 0.326 | -0.222 |
| 3.681946590007147 | -0.469 | 0.327 | -0.222 |
| 3.685088182660737 | -0.471 | 0.327 | -0.222 |
| 3.688229775314326 | -0.473 | 0.327 | -0.222 |
| 3.691371367967916 | -0.475 | 0.328 | -0.222 |
| 3.694512960621506 | -0.477 | 0.328 | -0.222 |
| 3.697654553275095 | -0.479 | 0.328 | -0.222 |
| 3.700796145928685 | -0.481 | 0.328 | -0.222 |
| 3.703937738582274 | -0.483 | 0.329 | -0.222 |
| 3.707079331235864 | -0.485 | 0.329 | -0.222 |
| 3.710220923889454 | -0.486 | 0.329 | -0.222 |
| 3.713362516543043 | -0.488 | 0.329 | -0.222 |
| 3.716504109196633 | -0.49 | 0.33 | -0.222 |
| 3.719645701850223 | -0.492 | 0.33 | -0.222 |
| 3.722787294503812 | -0.494 | 0.33 | -0.222 |
| 3.725928887157402 | -0.496 | 0.33 | -0.222 |
| 3.729070479810991 | -0.498 | 0.33 | -0.222 |
| 3.732212072464581 | -0.499 | 0.331 | -0.222 |
| 3.735353665118171 | -0.501 | 0.331 | -0.222 |
| 3.73849525777176 | -0.503 | 0.331 | -0.222 |
| 3.74163685042535 | -0.505 | 0.331 | -0.222 |
| 3.744778443078939 | -0.506 | 0.331 | -0.222 |
| 3.747920035732529 | -0.508 | 0.331 | -0.222 |
| 3.751061628386119 | -0.51 | 0.331 | -0.222 |
| 3.754203221039708 | -0.512 | 0.332 | -0.222 |
| 3.757344813693298 | -0.513 | 0.332 | -0.222 |
| 3.760486406346887 | -0.515 | 0.332 | -0.222 |
| 3.763627999000477 | -0.517 | 0.332 | -0.222 |
| 3.766769591654067 | -0.518 | 0.332 | -0.222 |
| 3.769911184307656 | -0.52 | 0.332 | -0.221 |
| 3.773052776961246 | -0.522 | 0.332 | -0.221 |
| 3.776194369614835 | -0.523 | 0.332 | -0.221 |
| 3.779335962268425 | -0.525 | 0.332 | -0.221 |
| 3.782477554922014 | -0.527 | 0.332 | -0.221 |
| 3.785619147575604 | -0.528 | 0.333 | -0.221 |
| 3.788760740229193 | -0.53 | 0.333 | -0.221 |
| 3.791902332882783 | -0.531 | 0.333 | -0.221 |
| 3.795043925536373 | -0.533 | 0.333 | -0.22 |
| 3.798185518189962 | -0.535 | 0.333 | -0.22 |
| 3.801327110843552 | -0.536 | 0.333 | -0.22 |
| 3.804468703497142 | -0.538 | 0.333 | -0.22 |
| 3.807610296150731 | -0.539 | 0.333 | -0.22 |
| 3.810751888804321 | -0.541 | 0.333 | -0.219 |
| 3.813893481457911 | -0.542 | 0.333 | -0.219 |
| 3.8170350741115 | -0.544 | 0.333 | -0.219 |
| 3.82017666676509 | -0.545 | 0.333 | -0.219 |
| 3.823318259418679 | -0.547 | 0.333 | -0.218 |
| 3.826459852072269 | -0.548 | 0.333 | -0.218 |
| 3.829601444725859 | -0.55 | 0.333 | -0.218 |
| 3.832743037379448 | -0.551 | 0.333 | -0.217 |
| 3.835884630033038 | -0.553 | 0.333 | -0.217 |
| 3.839026222686627 | -0.554 | 0.333 | -0.217 |
| 3.842167815340217 | -0.555 | 0.333 | -0.216 |
| 3.845309407993807 | -0.557 | 0.333 | -0.216 |
| 3.848451000647396 | -0.558 | 0.333 | -0.215 |
| 3.851592593300986 | -0.56 | 0.333 | -0.215 |
| 3.854734185954575 | -0.561 | 0.333 | -0.214 |
| 3.857875778608165 | -0.562 | 0.333 | -0.214 |
| 3.861017371261755 | -0.564 | 0.333 | -0.213 |
| 3.864158963915344 | -0.565 | 0.333 | -0.213 |
| 3.867300556568933 | -0.566 | 0.333 | -0.212 |
| 3.870442149222523 | -0.568 | 0.333 | -0.212 |
| 3.873583741876112 | -0.569 | 0.333 | -0.211 |
| 3.876725334529703 | -0.57 | 0.333 | -0.21 |
| 3.879866927183292 | -0.571 | 0.333 | -0.21 |
| 3.883008519836882 | -0.573 | 0.333 | -0.209 |
| 3.886150112490471 | -0.574 | 0.333 | -0.208 |
| 3.889291705144061 | -0.575 | 0.333 | -0.208 |
| 3.892433297797651 | -0.576 | 0.333 | -0.207 |
| 3.89557489045124 | -0.578 | 0.333 | -0.206 |
| 3.89871648310483 | -0.579 | 0.333 | -0.205 |
| 3.901858075758419 | -0.58 | 0.333 | -0.204 |
| 3.904999668412009 | -0.581 | 0.333 | -0.203 |
| 3.908141261065598 | -0.582 | 0.333 | -0.203 |
| 3.911282853719188 | -0.584 | 0.333 | -0.202 |
| 3.914424446372778 | -0.585 | 0.333 | -0.201 |
| 3.917566039026367 | -0.586 | 0.333 | -0.2 |
| 3.920707631679957 | -0.587 | 0.333 | -0.199 |
| 3.923849224333547 | -0.588 | 0.333 | -0.198 |
| 3.926990816987136 | -0.589 | 0.333 | -0.196 |
| 3.930132409640726 | -0.59 | 0.333 | -0.195 |
| 3.933274002294315 | -0.591 | 0.333 | -0.194 |
| 3.936415594947905 | -0.593 | 0.333 | -0.193 |
| 3.939557187601495 | -0.594 | 0.333 | -0.192 |
| 3.942698780255084 | -0.595 | 0.333 | -0.19 |
| 3.945840372908674 | -0.596 | 0.333 | -0.189 |
| 3.948981965562263 | -0.597 | 0.333 | -0.188 |
| 3.952123558215853 | -0.598 | 0.333 | -0.187 |
| 3.955265150869442 | -0.599 | 0.333 | -0.185 |
| 3.958406743523032 | -0.6 | 0.333 | -0.184 |
| 3.961548336176622 | -0.601 | 0.333 | -0.182 |
| 3.964689928830211 | -0.602 | 0.333 | -0.181 |
| 3.967831521483801 | -0.603 | 0.333 | -0.179 |
| 3.97097311413739 | -0.604 | 0.333 | -0.178 |
| 3.97411470679098 | -0.605 | 0.333 | -0.176 |
| 3.97725629944457 | -0.606 | 0.333 | -0.174 |
| 3.98039789209816 | -0.607 | 0.333 | -0.173 |
| 3.983539484751749 | -0.608 | 0.333 | -0.171 |
| 3.986681077405338 | -0.609 | 0.333 | -0.169 |
| 3.989822670058928 | -0.609 | 0.333 | -0.168 |
| 3.992964262712517 | -0.61 | 0.333 | -0.166 |
| 3.996105855366107 | -0.611 | 0.333 | -0.164 |
| 3.999247448019697 | -0.612 | 0.333 | -0.162 |
| 4.002389040673287 | -0.613 | 0.333 | -0.16 |
| 4.005530633326877 | -0.614 | 0.333 | -0.158 |
| 4.008672225980466 | -0.615 | 0.333 | -0.156 |
| 4.011813818634056 | -0.616 | 0.333 | -0.154 |
| 4.014955411287645 | -0.616 | 0.333 | -0.152 |
| 4.018097003941234 | -0.617 | 0.333 | -0.15 |
| 4.021238596594824 | -0.618 | 0.333 | -0.148 |
| 4.024380189248414 | -0.619 | 0.333 | -0.146 |
| 4.027521781902004 | -0.62 | 0.333 | -0.144 |
| 4.030663374555593 | -0.62 | 0.333 | -0.142 |
| 4.033804967209183 | -0.621 | 0.333 | -0.139 |
| 4.036946559862773 | -0.622 | 0.333 | -0.137 |
| 4.040088152516362 | -0.623 | 0.333 | -0.135 |
| 4.043229745169951 | -0.624 | 0.333 | -0.133 |
| 4.046371337823541 | -0.624 | 0.333 | -0.13 |
| 4.049512930477131 | -0.625 | 0.333 | -0.128 |
| 4.05265452313072 | -0.626 | 0.333 | -0.125 |
| 4.05579611578431 | -0.626 | 0.333 | -0.123 |
| 4.0589377084379 | -0.627 | 0.333 | -0.121 |
| 4.062079301091489 | -0.628 | 0.333 | -0.118 |
| 4.065220893745079 | -0.629 | 0.333 | -0.115 |
| 4.068362486398668 | -0.629 | 0.333 | -0.113 |
| 4.071504079052258 | -0.63 | 0.332 | -0.11 |
| 4.074645671705848 | -0.631 | 0.332 | -0.108 |
| 4.077787264359437 | -0.631 | 0.332 | -0.105 |
| 4.080928857013027 | -0.632 | 0.332 | -0.102 |
| 4.084070449666616 | -0.633 | 0.332 | -0.1 |
| 4.087212042320206 | -0.633 | 0.332 | -0.097 |
| 4.090353634973795 | -0.634 | 0.332 | -0.094 |
| 4.093495227627385 | -0.634 | 0.332 | -0.092 |
| 4.096636820280975 | -0.635 | 0.332 | -0.089 |
| 4.099778412934564 | -0.636 | 0.332 | -0.086 |
| 4.102920005588154 | -0.636 | 0.331 | -0.083 |
| 4.106061598241744 | -0.637 | 0.331 | -0.08 |
| 4.109203190895333 | -0.637 | 0.331 | -0.077 |
| 4.112344783548923 | -0.638 | 0.331 | -0.074 |
| 4.115486376202512 | -0.638 | 0.331 | -0.072 |
| 4.118627968856102 | -0.639 | 0.331 | -0.069 |
| 4.121769561509692 | -0.64 | 0.331 | -0.066 |
| 4.124911154163281 | -0.64 | 0.33 | -0.063 |
| 4.128052746816871 | -0.641 | 0.33 | -0.06 |
| 4.13119433947046 | -0.641 | 0.33 | -0.057 |
| 4.13433593212405 | -0.642 | 0.33 | -0.054 |
| 4.13747752477764 | -0.642 | 0.33 | -0.051 |
| 4.14061911743123 | -0.643 | 0.329 | -0.048 |
| 4.143760710084818 | -0.643 | 0.329 | -0.045 |
| 4.146902302738408 | -0.644 | 0.329 | -0.042 |
| 4.150043895391998 | -0.644 | 0.329 | -0.038 |
| 4.153185488045588 | -0.645 | 0.328 | -0.035 |
| 4.156327080699177 | -0.645 | 0.328 | -0.032 |
| 4.159468673352766 | -0.646 | 0.328 | -0.029 |
| 4.162610266006356 | -0.646 | 0.328 | -0.026 |
| 4.165751858659946 | -0.646 | 0.327 | -0.023 |
| 4.168893451313535 | -0.647 | 0.327 | -0.02 |
| 4.172035043967125 | -0.647 | 0.327 | -0.017 |
| 4.175176636620715 | -0.648 | 0.326 | -0.014 |
| 4.178318229274304 | -0.648 | 0.326 | -0.01 |
| 4.181459821927894 | -0.649 | 0.326 | -0.007 |
| 4.184601414581484 | -0.649 | 0.325 | -0.004 |
| 4.187743007235073 | -0.649 | 0.325 | -0.001 |
| 4.190884599888663 | -0.65 | 0.324 | 0.002 |
| 4.194026192542252 | -0.65 | 0.324 | 0.005 |
| 4.197167785195842 | -0.651 | 0.324 | 0.008 |
| 4.200309377849432 | -0.651 | 0.323 | 0.012 |
| 4.203450970503021 | -0.651 | 0.323 | 0.015 |
| 4.206592563156611 | -0.652 | 0.322 | 0.018 |
| 4.2097341558102 | -0.652 | 0.322 | 0.021 |
| 4.21287574846379 | -0.652 | 0.321 | 0.024 |
| 4.21601734111738 | -0.653 | 0.321 | 0.027 |
| 4.21915893377097 | -0.653 | 0.32 | 0.03 |
| 4.222300526424559 | -0.653 | 0.32 | 0.033 |
| 4.225442119078148 | -0.654 | 0.319 | 0.036 |
| 4.228583711731738 | -0.654 | 0.319 | 0.04 |
| 4.231725304385327 | -0.654 | 0.318 | 0.043 |
| 4.234866897038917 | -0.655 | 0.318 | 0.046 |
| 4.238008489692506 | -0.655 | 0.317 | 0.049 |
| 4.241150082346096 | -0.655 | 0.316 | 0.052 |
| 4.244291674999685 | -0.656 | 0.316 | 0.055 |
| 4.247433267653276 | -0.656 | 0.315 | 0.058 |
| 4.250574860306865 | -0.656 | 0.314 | 0.061 |
| 4.253716452960455 | -0.656 | 0.314 | 0.064 |
| 4.256858045614044 | -0.657 | 0.313 | 0.067 |
| 4.259999638267634 | -0.657 | 0.312 | 0.07 |
| 4.263141230921224 | -0.657 | 0.311 | 0.073 |
| 4.266282823574813 | -0.657 | 0.311 | 0.075 |
| 4.269424416228403 | -0.658 | 0.31 | 0.078 |
| 4.272566008881992 | -0.658 | 0.309 | 0.081 |
| 4.275707601535582 | -0.658 | 0.308 | 0.084 |
| 4.27884919418917 | -0.658 | 0.307 | 0.087 |
| 4.28199078684276 | -0.659 | 0.306 | 0.09 |
| 4.285132379496351 | -0.659 | 0.306 | 0.092 |
| 4.28827397214994 | -0.659 | 0.305 | 0.095 |
| 4.29141556480353 | -0.659 | 0.304 | 0.098 |
| 4.294557157457119 | -0.659 | 0.303 | 0.101 |
| 4.29769875011071 | -0.66 | 0.302 | 0.103 |
| 4.300840342764299 | -0.66 | 0.301 | 0.106 |
| 4.303981935417888 | -0.66 | 0.3 | 0.109 |
| 4.307123528071478 | -0.66 | 0.299 | 0.111 |
| 4.310265120725067 | -0.66 | 0.298 | 0.114 |
| 4.313406713378657 | -0.661 | 0.297 | 0.116 |
| 4.316548306032247 | -0.661 | 0.296 | 0.119 |
| 4.319689898685836 | -0.661 | 0.295 | 0.121 |
| 4.322831491339426 | -0.661 | 0.294 | 0.124 |
| 4.325973083993015 | -0.661 | 0.292 | 0.126 |
| 4.329114676646605 | -0.662 | 0.291 | 0.129 |
| 4.332256269300195 | -0.662 | 0.29 | 0.131 |
| 4.335397861953784 | -0.662 | 0.289 | 0.133 |
| 4.338539454607374 | -0.662 | 0.288 | 0.136 |
| 4.341681047260963 | -0.662 | 0.286 | 0.138 |
| 4.344822639914553 | -0.662 | 0.285 | 0.14 |
| 4.347964232568143 | -0.662 | 0.284 | 0.142 |
| 4.351105825221732 | -0.663 | 0.282 | 0.145 |
| 4.354247417875322 | -0.663 | 0.281 | 0.147 |
| 4.357389010528911 | -0.663 | 0.28 | 0.149 |
| 4.360530603182501 | -0.663 | 0.278 | 0.151 |
| 4.36367219583609 | -0.663 | 0.277 | 0.153 |
| 4.36681378848968 | -0.663 | 0.276 | 0.155 |
| 4.36995538114327 | -0.663 | 0.274 | 0.157 |
| 4.373096973796859 | -0.663 | 0.273 | 0.159 |
| 4.376238566450449 | -0.664 | 0.271 | 0.161 |
| 4.379380159104038 | -0.664 | 0.27 | 0.163 |
| 4.382521751757628 | -0.664 | 0.268 | 0.165 |
| 4.385663344411217 | -0.664 | 0.267 | 0.166 |
| 4.388804937064807 | -0.664 | 0.265 | 0.168 |
| 4.391946529718397 | -0.664 | 0.263 | 0.17 |
| 4.395088122371987 | -0.664 | 0.262 | 0.172 |
| 4.398229715025576 | -0.664 | 0.26 | 0.173 |
| 4.401371307679165 | -0.664 | 0.258 | 0.175 |
| 4.404512900332755 | -0.664 | 0.257 | 0.177 |
| 4.407654492986345 | -0.665 | 0.255 | 0.178 |
| 4.410796085639934 | -0.665 | 0.253 | 0.18 |
| 4.413937678293524 | -0.665 | 0.251 | 0.181 |
| 4.417079270947114 | -0.665 | 0.25 | 0.183 |
| 4.420220863600703 | -0.665 | 0.248 | 0.184 |
| 4.423362456254293 | -0.665 | 0.246 | 0.186 |
| 4.426504048907883 | -0.665 | 0.244 | 0.187 |
| 4.429645641561472 | -0.665 | 0.242 | 0.188 |
| 4.432787234215062 | -0.665 | 0.24 | 0.19 |
| 4.435928826868651 | -0.665 | 0.238 | 0.191 |
| 4.43907041952224 | -0.665 | 0.236 | 0.192 |
| 4.44221201217583 | -0.665 | 0.235 | 0.193 |
| 4.44535360482942 | -0.665 | 0.233 | 0.195 |
| 4.44849519748301 | -0.665 | 0.231 | 0.196 |
| 4.4516367901366 | -0.666 | 0.228 | 0.197 |
| 4.454778382790188 | -0.666 | 0.226 | 0.198 |
| 4.457919975443779 | -0.666 | 0.224 | 0.199 |
| 4.461061568097368 | -0.666 | 0.222 | 0.2 |
| 4.464203160750958 | -0.666 | 0.22 | 0.201 |
| 4.467344753404547 | -0.666 | 0.218 | 0.202 |
| 4.470486346058137 | -0.666 | 0.216 | 0.203 |
| 4.473627938711726 | -0.666 | 0.214 | 0.204 |
| 4.476769531365316 | -0.666 | 0.211 | 0.205 |
| 4.479911124018905 | -0.666 | 0.209 | 0.205 |
| 4.483052716672495 | -0.666 | 0.207 | 0.206 |
| 4.486194309326085 | -0.666 | 0.205 | 0.207 |
| 4.489335901979674 | -0.666 | 0.202 | 0.208 |
| 4.492477494633264 | -0.666 | 0.2 | 0.209 |
| 4.495619087286854 | -0.666 | 0.198 | 0.209 |
| 4.498760679940443 | -0.666 | 0.195 | 0.21 |
| 4.501902272594033 | -0.666 | 0.193 | 0.211 |
| 4.505043865247622 | -0.666 | 0.191 | 0.211 |
| 4.508185457901212 | -0.666 | 0.188 | 0.212 |
| 4.511327050554801 | -0.666 | 0.186 | 0.212 |
| 4.514468643208391 | -0.666 | 0.183 | 0.213 |
| 4.517610235861981 | -0.666 | 0.181 | 0.214 |
| 4.520751828515571 | -0.666 | 0.178 | 0.214 |
| 4.52389342116916 | -0.666 | 0.176 | 0.215 |
| 4.52703501382275 | -0.666 | 0.173 | 0.215 |
| 4.530176606476339 | -0.666 | 0.171 | 0.215 |
| 4.533318199129928 | -0.666 | 0.168 | 0.216 |
| 4.536459791783518 | -0.666 | 0.165 | 0.216 |
| 4.539601384437108 | -0.666 | 0.163 | 0.217 |
| 4.542742977090698 | -0.666 | 0.16 | 0.217 |
| 4.545884569744287 | -0.666 | 0.158 | 0.217 |
| 4.549026162397876 | -0.666 | 0.155 | 0.218 |
| 4.552167755051466 | -0.667 | 0.152 | 0.218 |
| 4.555309347705056 | -0.667 | 0.15 | 0.218 |
| 4.558450940358646 | -0.667 | 0.147 | 0.219 |
| 4.561592533012235 | -0.667 | 0.144 | 0.219 |
| 4.564734125665825 | -0.667 | 0.141 | 0.219 |
| 4.567875718319415 | -0.667 | 0.139 | 0.219 |
| 4.571017310973004 | -0.667 | 0.136 | 0.22 |
| 4.574158903626594 | -0.667 | 0.133 | 0.22 |
| 4.577300496280183 | -0.667 | 0.13 | 0.22 |
| 4.580442088933772 | -0.667 | 0.127 | 0.22 |
| 4.583583681587362 | -0.667 | 0.125 | 0.22 |
| 4.586725274240952 | -0.667 | 0.122 | 0.221 |
| 4.589866866894542 | -0.667 | 0.119 | 0.221 |
| 4.593008459548131 | -0.667 | 0.116 | 0.221 |
| 4.596150052201721 | -0.667 | 0.113 | 0.221 |
| 4.59929164485531 | -0.667 | 0.11 | 0.221 |
| 4.6024332375089 | -0.667 | 0.107 | 0.221 |
| 4.60557483016249 | -0.667 | 0.104 | 0.221 |
| 4.608716422816079 | -0.667 | 0.101 | 0.221 |
| 4.611858015469668 | -0.667 | 0.099 | 0.222 |
| 4.614999608123258 | -0.667 | 0.096 | 0.222 |
| 4.618141200776848 | -0.667 | 0.093 | 0.222 |
| 4.621282793430437 | -0.667 | 0.09 | 0.222 |
| 4.624424386084027 | -0.667 | 0.087 | 0.222 |
| 4.627565978737617 | -0.667 | 0.084 | 0.222 |
| 4.630707571391206 | -0.667 | 0.081 | 0.222 |
| 4.633849164044795 | -0.667 | 0.078 | 0.222 |
| 4.636990756698386 | -0.667 | 0.075 | 0.222 |
| 4.640132349351975 | -0.667 | 0.072 | 0.222 |
| 4.643273942005564 | -0.667 | 0.068 | 0.222 |
| 4.646415534659154 | -0.667 | 0.065 | 0.222 |
| 4.649557127312744 | -0.667 | 0.062 | 0.222 |
| 4.652698719966334 | -0.667 | 0.059 | 0.222 |
| 4.655840312619923 | -0.667 | 0.056 | 0.222 |
| 4.658981905273513 | -0.667 | 0.053 | 0.222 |
| 4.662123497927102 | -0.667 | 0.05 | 0.222 |
| 4.665265090580692 | -0.667 | 0.047 | 0.222 |
| 4.668406683234282 | -0.667 | 0.044 | 0.222 |
| 4.671548275887871 | -0.667 | 0.041 | 0.222 |
| 4.674689868541461 | -0.667 | 0.038 | 0.222 |
| 4.67783146119505 | -0.667 | 0.034 | 0.222 |
| 4.68097305384864 | -0.667 | 0.031 | 0.222 |
| 4.68411464650223 | -0.667 | 0.028 | 0.222 |
| 4.687256239155819 | -0.667 | 0.025 | 0.222 |
| 4.690397831809409 | -0.667 | 0.022 | 0.222 |
| 4.693539424462998 | -0.667 | 0.019 | 0.222 |
| 4.696681017116588 | -0.667 | 0.016 | 0.222 |
| 4.699822609770177 | -0.667 | 0.013 | 0.222 |
| 4.702964202423767 | -0.667 | 0.009 | 0.222 |
| 4.706105795077356 | -0.667 | 0.006 | 0.222 |
| 4.709247387730946 | -0.667 | 0.003 | 0.222 |
| 4.712388980384535 | -0.667 | 0 | 0.222 |
| 4.715530573038126 | -0.667 | -0.003 | 0.222 |
| 4.718672165691715 | -0.667 | -0.006 | 0.222 |
| 4.721813758345305 | -0.667 | -0.009 | 0.222 |
| 4.724955350998894 | -0.667 | -0.013 | 0.222 |
| 4.728096943652484 | -0.667 | -0.016 | 0.222 |
| 4.731238536306074 | -0.667 | -0.019 | 0.222 |
| 4.734380128959663 | -0.667 | -0.022 | 0.222 |
| 4.737521721613253 | -0.667 | -0.025 | 0.222 |
| 4.740663314266842 | -0.667 | -0.028 | 0.222 |
| 4.743804906920432 | -0.667 | -0.031 | 0.222 |
| 4.74694649957402 | -0.667 | -0.034 | 0.222 |
| 4.750088092227611 | -0.667 | -0.038 | 0.222 |
| 4.7532296848812 | -0.667 | -0.041 | 0.222 |
| 4.75637127753479 | -0.667 | -0.044 | 0.222 |
| 4.75951287018838 | -0.667 | -0.047 | 0.222 |
| 4.76265446284197 | -0.667 | -0.05 | 0.222 |
| 4.765796055495559 | -0.667 | -0.053 | 0.222 |
| 4.768937648149149 | -0.667 | -0.056 | 0.222 |
| 4.772079240802738 | -0.667 | -0.059 | 0.222 |
| 4.775220833456327 | -0.667 | -0.062 | 0.222 |
| 4.778362426109917 | -0.667 | -0.065 | 0.222 |
| 4.781504018763507 | -0.667 | -0.068 | 0.222 |
| 4.784645611417097 | -0.667 | -0.072 | 0.222 |
| 4.787787204070686 | -0.667 | -0.075 | 0.222 |
| 4.790928796724275 | -0.667 | -0.078 | 0.222 |
| 4.794070389377865 | -0.667 | -0.081 | 0.222 |
| 4.797211982031455 | -0.667 | -0.084 | 0.222 |
| 4.800353574685045 | -0.667 | -0.087 | 0.222 |
| 4.803495167338634 | -0.667 | -0.09 | 0.222 |
| 4.806636759992224 | -0.667 | -0.093 | 0.222 |
| 4.809778352645814 | -0.667 | -0.096 | 0.222 |
| 4.812919945299403 | -0.667 | -0.099 | 0.222 |
| 4.816061537952993 | -0.667 | -0.101 | 0.221 |
| 4.819203130606582 | -0.667 | -0.104 | 0.221 |
| 4.822344723260172 | -0.667 | -0.107 | 0.221 |
| 4.825486315913761 | -0.667 | -0.11 | 0.221 |
| 4.828627908567351 | -0.667 | -0.113 | 0.221 |
| 4.83176950122094 | -0.667 | -0.116 | 0.221 |
| 4.83491109387453 | -0.667 | -0.119 | 0.221 |
| 4.83805268652812 | -0.667 | -0.122 | 0.221 |
| 4.841194279181709 | -0.667 | -0.125 | 0.22 |
| 4.844335871835299 | -0.667 | -0.127 | 0.22 |
| 4.847477464488889 | -0.667 | -0.13 | 0.22 |
| 4.850619057142478 | -0.667 | -0.133 | 0.22 |
| 4.853760649796068 | -0.667 | -0.136 | 0.22 |
| 4.856902242449657 | -0.667 | -0.139 | 0.219 |
| 4.860043835103247 | -0.667 | -0.141 | 0.219 |
| 4.863185427756837 | -0.667 | -0.144 | 0.219 |
| 4.866327020410426 | -0.667 | -0.147 | 0.219 |
| 4.869468613064015 | -0.667 | -0.15 | 0.218 |
| 4.872610205717605 | -0.667 | -0.152 | 0.218 |
| 4.875751798371195 | -0.666 | -0.155 | 0.218 |
| 4.878893391024784 | -0.666 | -0.158 | 0.217 |
| 4.882034983678374 | -0.666 | -0.16 | 0.217 |
| 4.885176576331964 | -0.666 | -0.163 | 0.217 |
| 4.888318168985553 | -0.666 | -0.165 | 0.216 |
| 4.891459761639143 | -0.666 | -0.168 | 0.216 |
| 4.894601354292733 | -0.666 | -0.171 | 0.215 |
| 4.897742946946322 | -0.666 | -0.173 | 0.215 |
| 4.900884539599912 | -0.666 | -0.176 | 0.215 |
| 4.904026132253501 | -0.666 | -0.178 | 0.214 |
| 4.907167724907091 | -0.666 | -0.181 | 0.214 |
| 4.91030931756068 | -0.666 | -0.183 | 0.213 |
| 4.91345091021427 | -0.666 | -0.186 | 0.212 |
| 4.91659250286786 | -0.666 | -0.188 | 0.212 |
| 4.91973409552145 | -0.666 | -0.191 | 0.211 |
| 4.922875688175039 | -0.666 | -0.193 | 0.211 |
| 4.926017280828628 | -0.666 | -0.195 | 0.21 |
| 4.929158873482218 | -0.666 | -0.198 | 0.209 |
| 4.932300466135808 | -0.666 | -0.2 | 0.209 |
| 4.935442058789397 | -0.666 | -0.202 | 0.208 |
| 4.938583651442987 | -0.666 | -0.205 | 0.207 |
| 4.941725244096576 | -0.666 | -0.207 | 0.206 |
| 4.944866836750166 | -0.666 | -0.209 | 0.205 |
| 4.948008429403755 | -0.666 | -0.211 | 0.205 |
| 4.951150022057345 | -0.666 | -0.214 | 0.204 |
| 4.954291614710935 | -0.666 | -0.216 | 0.203 |
| 4.957433207364524 | -0.666 | -0.218 | 0.202 |
| 4.960574800018114 | -0.666 | -0.22 | 0.201 |
| 4.963716392671704 | -0.666 | -0.222 | 0.2 |
| 4.966857985325293 | -0.666 | -0.224 | 0.199 |
| 4.969999577978883 | -0.666 | -0.226 | 0.198 |
| 4.973141170632472 | -0.666 | -0.228 | 0.197 |
| 4.976282763286062 | -0.665 | -0.231 | 0.196 |
| 4.979424355939651 | -0.665 | -0.233 | 0.195 |
| 4.982565948593241 | -0.665 | -0.235 | 0.193 |
| 4.985707541246831 | -0.665 | -0.236 | 0.192 |
| 4.98884913390042 | -0.665 | -0.238 | 0.191 |
| 4.99199072655401 | -0.665 | -0.24 | 0.19 |
| 4.9951323192076 | -0.665 | -0.242 | 0.188 |
| 4.99827391186119 | -0.665 | -0.244 | 0.187 |
| 5.00141550451478 | -0.665 | -0.246 | 0.186 |
| 5.004557097168369 | -0.665 | -0.248 | 0.184 |
| 5.007698689821958 | -0.665 | -0.25 | 0.183 |
| 5.010840282475548 | -0.665 | -0.251 | 0.181 |
| 5.013981875129137 | -0.665 | -0.253 | 0.18 |
| 5.017123467782727 | -0.665 | -0.255 | 0.178 |
| 5.020265060436317 | -0.664 | -0.257 | 0.177 |
| 5.023406653089906 | -0.664 | -0.258 | 0.175 |
| 5.026548245743496 | -0.664 | -0.26 | 0.173 |
| 5.029689838397085 | -0.664 | -0.262 | 0.172 |
| 5.032831431050674 | -0.664 | -0.263 | 0.17 |
| 5.035973023704264 | -0.664 | -0.265 | 0.168 |
| 5.039114616357854 | -0.664 | -0.267 | 0.166 |
| 5.042256209011444 | -0.664 | -0.268 | 0.165 |
| 5.045397801665033 | -0.664 | -0.27 | 0.163 |
| 5.048539394318622 | -0.664 | -0.271 | 0.161 |
| 5.051680986972213 | -0.663 | -0.273 | 0.159 |
| 5.054822579625802 | -0.663 | -0.274 | 0.157 |
| 5.057964172279392 | -0.663 | -0.276 | 0.155 |
| 5.061105764932981 | -0.663 | -0.277 | 0.153 |
| 5.064247357586571 | -0.663 | -0.278 | 0.151 |
| 5.067388950240161 | -0.663 | -0.28 | 0.149 |
| 5.07053054289375 | -0.663 | -0.281 | 0.147 |
| 5.07367213554734 | -0.663 | -0.282 | 0.145 |
| 5.07681372820093 | -0.662 | -0.284 | 0.142 |
| 5.079955320854519 | -0.662 | -0.285 | 0.14 |
| 5.083096913508108 | -0.662 | -0.286 | 0.138 |
| 5.086238506161698 | -0.662 | -0.288 | 0.136 |
| 5.089380098815288 | -0.662 | -0.289 | 0.133 |
| 5.092521691468877 | -0.662 | -0.29 | 0.131 |
| 5.095663284122466 | -0.662 | -0.291 | 0.129 |
| 5.098804876776057 | -0.661 | -0.292 | 0.126 |
| 5.101946469429646 | -0.661 | -0.294 | 0.124 |
| 5.105088062083236 | -0.661 | -0.295 | 0.121 |
| 5.108229654736825 | -0.661 | -0.296 | 0.119 |
| 5.111371247390415 | -0.661 | -0.297 | 0.116 |
| 5.114512840044005 | -0.66 | -0.298 | 0.114 |
| 5.117654432697594 | -0.66 | -0.299 | 0.111 |
| 5.120796025351184 | -0.66 | -0.3 | 0.109 |
| 5.123937618004773 | -0.66 | -0.301 | 0.106 |
| 5.127079210658363 | -0.66 | -0.302 | 0.103 |
| 5.130220803311953 | -0.659 | -0.303 | 0.101 |
| 5.133362395965542 | -0.659 | -0.304 | 0.098 |
| 5.136503988619131 | -0.659 | -0.305 | 0.095 |
| 5.13964558127272 | -0.659 | -0.306 | 0.092 |
| 5.142787173926311 | -0.659 | -0.306 | 0.09 |
| 5.1459287665799 | -0.658 | -0.307 | 0.087 |
| 5.14907035923349 | -0.658 | -0.308 | 0.084 |
| 5.15221195188708 | -0.658 | -0.309 | 0.081 |
| 5.15535354454067 | -0.658 | -0.31 | 0.078 |
| 5.158495137194259 | -0.657 | -0.311 | 0.075 |
| 5.161636729847848 | -0.657 | -0.311 | 0.073 |
| 5.164778322501438 | -0.657 | -0.312 | 0.07 |
| 5.167919915155028 | -0.657 | -0.313 | 0.067 |
| 5.171061507808617 | -0.656 | -0.314 | 0.064 |
| 5.174203100462206 | -0.656 | -0.314 | 0.061 |
| 5.177344693115796 | -0.656 | -0.315 | 0.058 |
| 5.180486285769386 | -0.656 | -0.316 | 0.055 |
| 5.183627878422976 | -0.655 | -0.316 | 0.052 |
| 5.186769471076565 | -0.655 | -0.317 | 0.049 |
| 5.189911063730155 | -0.655 | -0.318 | 0.046 |
| 5.193052656383744 | -0.654 | -0.318 | 0.043 |
| 5.196194249037334 | -0.654 | -0.319 | 0.04 |
| 5.199335841690924 | -0.654 | -0.319 | 0.036 |
| 5.202477434344513 | -0.653 | -0.32 | 0.033 |
| 5.205619026998103 | -0.653 | -0.32 | 0.03 |
| 5.208760619651692 | -0.653 | -0.321 | 0.027 |
| 5.211902212305282 | -0.652 | -0.321 | 0.024 |
| 5.215043804958871 | -0.652 | -0.322 | 0.021 |
| 5.218185397612461 | -0.652 | -0.322 | 0.018 |
| 5.221326990266051 | -0.651 | -0.323 | 0.015 |
| 5.22446858291964 | -0.651 | -0.323 | 0.012 |
| 5.22761017557323 | -0.651 | -0.324 | 0.008 |
| 5.23075176822682 | -0.65 | -0.324 | 0.005 |
| 5.23389336088041 | -0.65 | -0.324 | 0.002 |
| 5.237034953533999 | -0.649 | -0.325 | -0.001 |
| 5.240176546187588 | -0.649 | -0.325 | -0.004 |
| 5.243318138841178 | -0.649 | -0.326 | -0.007 |
| 5.246459731494767 | -0.648 | -0.326 | -0.01 |
| 5.249601324148357 | -0.648 | -0.326 | -0.014 |
| 5.252742916801947 | -0.647 | -0.327 | -0.017 |
| 5.255884509455536 | -0.647 | -0.327 | -0.02 |
| 5.259026102109125 | -0.646 | -0.327 | -0.023 |
| 5.262167694762715 | -0.646 | -0.328 | -0.026 |
| 5.265309287416305 | -0.646 | -0.328 | -0.029 |
| 5.268450880069895 | -0.645 | -0.328 | -0.032 |
| 5.271592472723484 | -0.645 | -0.328 | -0.035 |
| 5.274734065377074 | -0.644 | -0.329 | -0.038 |
| 5.277875658030664 | -0.644 | -0.329 | -0.042 |
| 5.281017250684253 | -0.643 | -0.329 | -0.045 |
| 5.284158843337843 | -0.643 | -0.329 | -0.048 |
| 5.287300435991432 | -0.642 | -0.33 | -0.051 |
| 5.290442028645022 | -0.642 | -0.33 | -0.054 |
| 5.293583621298612 | -0.641 | -0.33 | -0.057 |
| 5.296725213952201 | -0.641 | -0.33 | -0.06 |
| 5.299866806605791 | -0.64 | -0.33 | -0.063 |
| 5.30300839925938 | -0.64 | -0.331 | -0.066 |
| 5.30614999191297 | -0.639 | -0.331 | -0.069 |
| 5.30929158456656 | -0.638 | -0.331 | -0.072 |
| 5.312433177220149 | -0.638 | -0.331 | -0.074 |
| 5.315574769873739 | -0.637 | -0.331 | -0.077 |
| 5.318716362527328 | -0.637 | -0.331 | -0.08 |
| 5.321857955180918 | -0.636 | -0.331 | -0.083 |
| 5.324999547834508 | -0.636 | -0.332 | -0.086 |
| 5.328141140488097 | -0.635 | -0.332 | -0.089 |
| 5.331282733141686 | -0.634 | -0.332 | -0.092 |
| 5.334424325795276 | -0.634 | -0.332 | -0.094 |
| 5.337565918448866 | -0.633 | -0.332 | -0.097 |
| 5.340707511102456 | -0.633 | -0.332 | -0.1 |
| 5.343849103756045 | -0.632 | -0.332 | -0.102 |
| 5.346990696409634 | -0.631 | -0.332 | -0.105 |
| 5.350132289063224 | -0.631 | -0.332 | -0.108 |
| 5.353273881716814 | -0.63 | -0.332 | -0.11 |
| 5.356415474370403 | -0.629 | -0.333 | -0.113 |
| 5.359557067023993 | -0.629 | -0.333 | -0.115 |
| 5.362698659677583 | -0.628 | -0.333 | -0.118 |
| 5.365840252331172 | -0.627 | -0.333 | -0.121 |
| 5.368981844984762 | -0.626 | -0.333 | -0.123 |
| 5.372123437638351 | -0.626 | -0.333 | -0.125 |
| 5.375265030291941 | -0.625 | -0.333 | -0.128 |
| 5.378406622945531 | -0.624 | -0.333 | -0.13 |
| 5.38154821559912 | -0.624 | -0.333 | -0.133 |
| 5.38468980825271 | -0.623 | -0.333 | -0.135 |
| 5.387831400906299 | -0.622 | -0.333 | -0.137 |
| 5.39097299355989 | -0.621 | -0.333 | -0.139 |
| 5.394114586213479 | -0.62 | -0.333 | -0.142 |
| 5.397256178867068 | -0.62 | -0.333 | -0.144 |
| 5.400397771520657 | -0.619 | -0.333 | -0.146 |
| 5.403539364174247 | -0.618 | -0.333 | -0.148 |
| 5.406680956827837 | -0.617 | -0.333 | -0.15 |
| 5.409822549481426 | -0.616 | -0.333 | -0.152 |
| 5.412964142135016 | -0.616 | -0.333 | -0.154 |
| 5.416105734788605 | -0.615 | -0.333 | -0.156 |
| 5.419247327442195 | -0.614 | -0.333 | -0.158 |
| 5.422388920095785 | -0.613 | -0.333 | -0.16 |
| 5.425530512749375 | -0.612 | -0.333 | -0.162 |
| 5.428672105402964 | -0.611 | -0.333 | -0.164 |
| 5.431813698056554 | -0.61 | -0.333 | -0.166 |
| 5.434955290710143 | -0.609 | -0.333 | -0.168 |
| 5.438096883363733 | -0.609 | -0.333 | -0.169 |
| 5.441238476017322 | -0.608 | -0.333 | -0.171 |
| 5.444380068670912 | -0.607 | -0.333 | -0.173 |
| 5.447521661324502 | -0.606 | -0.333 | -0.174 |
| 5.450663253978091 | -0.605 | -0.333 | -0.176 |
| 5.453804846631681 | -0.604 | -0.333 | -0.178 |
| 5.456946439285271 | -0.603 | -0.333 | -0.179 |
| 5.46008803193886 | -0.602 | -0.333 | -0.181 |
| 5.46322962459245 | -0.601 | -0.333 | -0.182 |
| 5.466371217246039 | -0.6 | -0.333 | -0.184 |
| 5.46951280989963 | -0.599 | -0.333 | -0.185 |
| 5.472654402553218 | -0.598 | -0.333 | -0.187 |
| 5.475795995206808 | -0.597 | -0.333 | -0.188 |
| 5.478937587860398 | -0.596 | -0.333 | -0.189 |
| 5.482079180513987 | -0.595 | -0.333 | -0.19 |
| 5.485220773167577 | -0.594 | -0.333 | -0.192 |
| 5.488362365821166 | -0.593 | -0.333 | -0.193 |
| 5.491503958474756 | -0.591 | -0.333 | -0.194 |
| 5.494645551128346 | -0.59 | -0.333 | -0.195 |
| 5.497787143781935 | -0.589 | -0.333 | -0.196 |
| 5.500928736435525 | -0.588 | -0.333 | -0.198 |
| 5.504070329089115 | -0.587 | -0.333 | -0.199 |
| 5.507211921742704 | -0.586 | -0.333 | -0.2 |
| 5.510353514396294 | -0.585 | -0.333 | -0.201 |
| 5.513495107049883 | -0.584 | -0.333 | -0.202 |
| 5.516636699703473 | -0.582 | -0.333 | -0.203 |
| 5.519778292357062 | -0.581 | -0.333 | -0.203 |
| 5.522919885010652 | -0.58 | -0.333 | -0.204 |
| 5.526061477664242 | -0.579 | -0.333 | -0.205 |
| 5.529203070317831 | -0.578 | -0.333 | -0.206 |
| 5.532344662971421 | -0.576 | -0.333 | -0.207 |
| 5.535486255625011 | -0.575 | -0.333 | -0.208 |
| 5.5386278482786 | -0.574 | -0.333 | -0.208 |
| 5.54176944093219 | -0.573 | -0.333 | -0.209 |
| 5.544911033585779 | -0.571 | -0.333 | -0.21 |
| 5.54805262623937 | -0.57 | -0.333 | -0.21 |
| 5.551194218892959 | -0.569 | -0.333 | -0.211 |
| 5.554335811546548 | -0.568 | -0.333 | -0.212 |
| 5.557477404200137 | -0.566 | -0.333 | -0.212 |
| 5.560618996853727 | -0.565 | -0.333 | -0.213 |
| 5.563760589507317 | -0.564 | -0.333 | -0.213 |
| 5.566902182160906 | -0.562 | -0.333 | -0.214 |
| 5.570043774814496 | -0.561 | -0.333 | -0.214 |
| 5.573185367468086 | -0.56 | -0.333 | -0.215 |
| 5.576326960121675 | -0.558 | -0.333 | -0.215 |
| 5.579468552775264 | -0.557 | -0.333 | -0.216 |
| 5.582610145428854 | -0.555 | -0.333 | -0.216 |
| 5.585751738082444 | -0.554 | -0.333 | -0.217 |
| 5.588893330736034 | -0.553 | -0.333 | -0.217 |
| 5.592034923389623 | -0.551 | -0.333 | -0.217 |
| 5.595176516043213 | -0.55 | -0.333 | -0.218 |
| 5.598318108696803 | -0.548 | -0.333 | -0.218 |
| 5.601459701350392 | -0.547 | -0.333 | -0.218 |
| 5.604601294003982 | -0.545 | -0.333 | -0.219 |
| 5.607742886657571 | -0.544 | -0.333 | -0.219 |
| 5.610884479311161 | -0.542 | -0.333 | -0.219 |
| 5.61402607196475 | -0.541 | -0.333 | -0.219 |
| 5.61716766461834 | -0.539 | -0.333 | -0.22 |
| 5.62030925727193 | -0.538 | -0.333 | -0.22 |
| 5.623450849925519 | -0.536 | -0.333 | -0.22 |
| 5.626592442579109 | -0.535 | -0.333 | -0.22 |
| 5.629734035232698 | -0.533 | -0.333 | -0.22 |
| 5.632875627886288 | -0.531 | -0.333 | -0.221 |
| 5.636017220539878 | -0.53 | -0.333 | -0.221 |
| 5.639158813193467 | -0.528 | -0.333 | -0.221 |
| 5.642300405847057 | -0.527 | -0.332 | -0.221 |
| 5.645441998500646 | -0.525 | -0.332 | -0.221 |
| 5.648583591154236 | -0.523 | -0.332 | -0.221 |
| 5.651725183807825 | -0.522 | -0.332 | -0.221 |
| 5.654866776461415 | -0.52 | -0.332 | -0.221 |
| 5.658008369115005 | -0.518 | -0.332 | -0.222 |
| 5.661149961768594 | -0.517 | -0.332 | -0.222 |
| 5.664291554422184 | -0.515 | -0.332 | -0.222 |
| 5.667433147075774 | -0.513 | -0.332 | -0.222 |
| 5.670574739729363 | -0.512 | -0.332 | -0.222 |
| 5.673716332382953 | -0.51 | -0.331 | -0.222 |
| 5.676857925036542 | -0.508 | -0.331 | -0.222 |
| 5.679999517690132 | -0.506 | -0.331 | -0.222 |
| 5.683141110343721 | -0.505 | -0.331 | -0.222 |
| 5.686282702997311 | -0.503 | -0.331 | -0.222 |
| 5.689424295650901 | -0.501 | -0.331 | -0.222 |
| 5.69256588830449 | -0.499 | -0.331 | -0.222 |
| 5.69570748095808 | -0.498 | -0.33 | -0.222 |
| 5.69884907361167 | -0.496 | -0.33 | -0.222 |
| 5.701990666265259 | -0.494 | -0.33 | -0.222 |
| 5.705132258918849 | -0.492 | -0.33 | -0.222 |
| 5.708273851572438 | -0.49 | -0.33 | -0.222 |
| 5.711415444226028 | -0.488 | -0.329 | -0.222 |
| 5.714557036879618 | -0.486 | -0.329 | -0.222 |
| 5.717698629533207 | -0.485 | -0.329 | -0.222 |
| 5.720840222186797 | -0.483 | -0.329 | -0.222 |
| 5.723981814840386 | -0.481 | -0.328 | -0.222 |
| 5.727123407493976 | -0.479 | -0.328 | -0.222 |
| 5.730265000147565 | -0.477 | -0.328 | -0.222 |
| 5.733406592801155 | -0.475 | -0.328 | -0.222 |
| 5.736548185454744 | -0.473 | -0.327 | -0.222 |
| 5.739689778108334 | -0.471 | -0.327 | -0.222 |
| 5.742831370761924 | -0.469 | -0.327 | -0.222 |
| 5.745972963415514 | -0.467 | -0.326 | -0.222 |
| 5.749114556069103 | -0.465 | -0.326 | -0.222 |
| 5.752256148722693 | -0.463 | -0.326 | -0.222 |
| 5.755397741376282 | -0.461 | -0.325 | -0.222 |
| 5.758539334029872 | -0.459 | -0.325 | -0.222 |
| 5.761680926683462 | -0.457 | -0.324 | -0.222 |
| 5.764822519337051 | -0.455 | -0.324 | -0.222 |
| 5.767964111990641 | -0.453 | -0.324 | -0.222 |
| 5.77110570464423 | -0.451 | -0.323 | -0.222 |
| 5.77424729729782 | -0.449 | -0.323 | -0.222 |
| 5.77738888995141 | -0.447 | -0.322 | -0.222 |
| 5.780530482605 | -0.444 | -0.322 | -0.222 |
| 5.783672075258588 | -0.442 | -0.321 | -0.222 |
| 5.786813667912178 | -0.44 | -0.321 | -0.222 |
| 5.789955260565768 | -0.438 | -0.32 | -0.222 |
| 5.793096853219358 | -0.436 | -0.32 | -0.222 |
| 5.796238445872947 | -0.434 | -0.319 | -0.222 |
| 5.799380038526537 | -0.432 | -0.319 | -0.222 |
| 5.802521631180126 | -0.429 | -0.318 | -0.222 |
| 5.805663223833715 | -0.427 | -0.318 | -0.222 |
| 5.808804816487306 | -0.425 | -0.317 | -0.222 |
| 5.811946409140895 | -0.423 | -0.316 | -0.222 |
| 5.815088001794485 | -0.421 | -0.316 | -0.222 |
| 5.818229594448074 | -0.418 | -0.315 | -0.222 |
| 5.821371187101663 | -0.416 | -0.314 | -0.222 |
| 5.824512779755254 | -0.414 | -0.314 | -0.222 |
| 5.827654372408843 | -0.412 | -0.313 | -0.222 |
| 5.830795965062433 | -0.409 | -0.312 | -0.222 |
| 5.833937557716022 | -0.407 | -0.311 | -0.222 |
| 5.837079150369612 | -0.405 | -0.311 | -0.222 |
| 5.840220743023201 | -0.402 | -0.31 | -0.222 |
| 5.843362335676791 | -0.4 | -0.309 | -0.222 |
| 5.846503928330381 | -0.398 | -0.308 | -0.222 |
| 5.84964552098397 | -0.395 | -0.307 | -0.222 |
| 5.85278711363756 | -0.393 | -0.306 | -0.222 |
| 5.85592870629115 | -0.391 | -0.306 | -0.222 |
| 5.85907029894474 | -0.388 | -0.305 | -0.222 |
| 5.862211891598329 | -0.386 | -0.304 | -0.221 |
| 5.865353484251918 | -0.384 | -0.303 | -0.221 |
| 5.868495076905508 | -0.381 | -0.302 | -0.221 |
| 5.871636669559098 | -0.379 | -0.301 | -0.221 |
| 5.874778262212687 | -0.376 | -0.3 | -0.221 |
| 5.877919854866277 | -0.374 | -0.299 | -0.221 |
| 5.881061447519866 | -0.371 | -0.298 | -0.221 |
| 5.884203040173456 | -0.369 | -0.297 | -0.221 |
| 5.887344632827046 | -0.366 | -0.296 | -0.221 |
| 5.890486225480635 | -0.364 | -0.295 | -0.22 |
| 5.893627818134224 | -0.362 | -0.294 | -0.22 |
| 5.896769410787814 | -0.359 | -0.292 | -0.22 |
| 5.899911003441404 | -0.357 | -0.291 | -0.22 |
| 5.903052596094994 | -0.354 | -0.29 | -0.22 |
| 5.906194188748583 | -0.351 | -0.289 | -0.219 |
| 5.909335781402172 | -0.349 | -0.288 | -0.219 |
| 5.912477374055762 | -0.346 | -0.286 | -0.219 |
| 5.915618966709352 | -0.344 | -0.285 | -0.219 |
| 5.918760559362942 | -0.341 | -0.284 | -0.218 |
| 5.921902152016531 | -0.339 | -0.282 | -0.218 |
| 5.92504374467012 | -0.336 | -0.281 | -0.218 |
| 5.92818533732371 | -0.334 | -0.28 | -0.217 |
| 5.9313269299773 | -0.331 | -0.278 | -0.217 |
| 5.93446852263089 | -0.328 | -0.277 | -0.216 |
| 5.93761011528448 | -0.326 | -0.276 | -0.216 |
| 5.940751707938068 | -0.323 | -0.274 | -0.216 |
| 5.943893300591658 | -0.321 | -0.273 | -0.215 |
| 5.947034893245248 | -0.318 | -0.271 | -0.215 |
| 5.950176485898837 | -0.315 | -0.27 | -0.214 |
| 5.953318078552427 | -0.313 | -0.268 | -0.214 |
| 5.956459671206017 | -0.31 | -0.267 | -0.213 |
| 5.959601263859606 | -0.307 | -0.265 | -0.213 |
| 5.962742856513196 | -0.305 | -0.263 | -0.212 |
| 5.965884449166785 | -0.302 | -0.262 | -0.211 |
| 5.969026041820375 | -0.299 | -0.26 | -0.211 |
| 5.972167634473964 | -0.296 | -0.258 | -0.21 |
| 5.975309227127554 | -0.294 | -0.257 | -0.21 |
| 5.978450819781144 | -0.291 | -0.255 | -0.209 |
| 5.981592412434733 | -0.288 | -0.253 | -0.208 |
| 5.984734005088323 | -0.286 | -0.251 | -0.207 |
| 5.987875597741913 | -0.283 | -0.25 | -0.207 |
| 5.991017190395502 | -0.28 | -0.248 | -0.206 |
| 5.994158783049092 | -0.277 | -0.246 | -0.205 |
| 5.997300375702681 | -0.275 | -0.244 | -0.204 |
| 6.000441968356271 | -0.272 | -0.242 | -0.203 |
| 6.003583561009861 | -0.269 | -0.24 | -0.202 |
| 6.00672515366345 | -0.266 | -0.238 | -0.201 |
| 6.00986674631704 | -0.263 | -0.236 | -0.2 |
| 6.01300833897063 | -0.261 | -0.235 | -0.199 |
| 6.01614993162422 | -0.258 | -0.233 | -0.198 |
| 6.019291524277808 | -0.255 | -0.231 | -0.197 |
| 6.022433116931398 | -0.252 | -0.228 | -0.196 |
| 6.025574709584988 | -0.249 | -0.226 | -0.195 |
| 6.028716302238577 | -0.246 | -0.224 | -0.194 |
| 6.031857894892167 | -0.244 | -0.222 | -0.193 |
| 6.034999487545757 | -0.241 | -0.22 | -0.191 |
| 6.038141080199346 | -0.238 | -0.218 | -0.19 |
| 6.041282672852935 | -0.235 | -0.216 | -0.189 |
| 6.044424265506525 | -0.232 | -0.214 | -0.187 |
| 6.047565858160115 | -0.229 | -0.211 | -0.186 |
| 6.050707450813704 | -0.226 | -0.209 | -0.185 |
| 6.053849043467294 | -0.223 | -0.207 | -0.183 |
| 6.056990636120884 | -0.221 | -0.205 | -0.182 |
| 6.060132228774473 | -0.218 | -0.202 | -0.18 |
| 6.063273821428063 | -0.215 | -0.2 | -0.179 |
| 6.066415414081653 | -0.212 | -0.198 | -0.177 |
| 6.069557006735242 | -0.209 | -0.195 | -0.176 |
| 6.072698599388831 | -0.206 | -0.193 | -0.174 |
| 6.07584019204242 | -0.203 | -0.191 | -0.172 |
| 6.078981784696011 | -0.2 | -0.188 | -0.171 |
| 6.082123377349601 | -0.197 | -0.186 | -0.169 |
| 6.08526497000319 | -0.194 | -0.183 | -0.167 |
| 6.08840656265678 | -0.191 | -0.181 | -0.165 |
| 6.09154815531037 | -0.188 | -0.178 | -0.163 |
| 6.094689747963959 | -0.185 | -0.176 | -0.162 |
| 6.097831340617549 | -0.182 | -0.173 | -0.16 |
| 6.100972933271138 | -0.179 | -0.171 | -0.158 |
| 6.104114525924728 | -0.176 | -0.168 | -0.156 |
| 6.107256118578317 | -0.173 | -0.165 | -0.154 |
| 6.110397711231907 | -0.17 | -0.163 | -0.152 |
| 6.113539303885497 | -0.167 | -0.16 | -0.15 |
| 6.116680896539086 | -0.164 | -0.158 | -0.147 |
| 6.119822489192675 | -0.161 | -0.155 | -0.145 |
| 6.122964081846265 | -0.158 | -0.152 | -0.143 |
| 6.126105674499855 | -0.155 | -0.15 | -0.141 |
| 6.129247267153445 | -0.152 | -0.147 | -0.139 |
| 6.132388859807034 | -0.149 | -0.144 | -0.136 |
| 6.135530452460624 | -0.146 | -0.141 | -0.134 |
| 6.138672045114213 | -0.143 | -0.139 | -0.132 |
| 6.141813637767803 | -0.14 | -0.136 | -0.129 |
| 6.144955230421393 | -0.137 | -0.133 | -0.127 |
| 6.148096823074982 | -0.134 | -0.13 | -0.125 |
| 6.151238415728571 | -0.131 | -0.127 | -0.122 |
| 6.154380008382161 | -0.128 | -0.125 | -0.12 |
| 6.157521601035751 | -0.125 | -0.122 | -0.117 |
| 6.16066319368934 | -0.122 | -0.119 | -0.115 |
| 6.16380478634293 | -0.119 | -0.116 | -0.112 |
| 6.16694637899652 | -0.115 | -0.113 | -0.109 |
| 6.170087971650109 | -0.112 | -0.11 | -0.107 |
| 6.173229564303698 | -0.109 | -0.107 | -0.104 |
| 6.176371156957289 | -0.106 | -0.104 | -0.102 |
| 6.179512749610878 | -0.103 | -0.101 | -0.099 |
| 6.182654342264468 | -0.1 | -0.099 | -0.096 |
| 6.185795934918057 | -0.097 | -0.096 | -0.093 |
| 6.188937527571647 | -0.094 | -0.093 | -0.091 |
| 6.192079120225237 | -0.091 | -0.09 | -0.088 |
| 6.195220712878826 | -0.088 | -0.087 | -0.085 |
| 6.198362305532415 | -0.085 | -0.084 | -0.082 |
| 6.201503898186005 | -0.081 | -0.081 | -0.079 |
| 6.204645490839594 | -0.078 | -0.078 | -0.076 |
| 6.207787083493184 | -0.075 | -0.075 | -0.074 |
| 6.210928676146774 | -0.072 | -0.072 | -0.071 |
| 6.214070268800364 | -0.069 | -0.068 | -0.068 |
| 6.217211861453953 | -0.066 | -0.065 | -0.065 |
| 6.220353454107543 | -0.063 | -0.062 | -0.062 |
| 6.223495046761133 | -0.06 | -0.059 | -0.059 |
| 6.226636639414722 | -0.056 | -0.056 | -0.056 |
| 6.229778232068312 | -0.053 | -0.053 | -0.053 |
| 6.232919824721901 | -0.05 | -0.05 | -0.05 |
| 6.236061417375491 | -0.047 | -0.047 | -0.047 |
| 6.23920301002908 | -0.044 | -0.044 | -0.044 |
| 6.24234460268267 | -0.041 | -0.041 | -0.041 |
| 6.24548619533626 | -0.038 | -0.038 | -0.037 |
| 6.24862778798985 | -0.035 | -0.034 | -0.034 |
| 6.251769380643438 | -0.031 | -0.031 | -0.031 |
| 6.254910973297028 | -0.028 | -0.028 | -0.028 |
| 6.258052565950618 | -0.025 | -0.025 | -0.025 |
| 6.261194158604208 | -0.022 | -0.022 | -0.022 |
| 6.264335751257797 | -0.019 | -0.019 | -0.019 |
| 6.267477343911387 | -0.016 | -0.016 | -0.016 |
| 6.270618936564976 | -0.013 | -0.013 | -0.013 |
| 6.273760529218566 | -0.009 | -0.009 | -0.009 |
| 6.276902121872155 | -0.006 | -0.006 | -0.006 |
| 6.280043714525745 | -0.003 | -0.003 | -0.003 |
| 6.283185307179335 | 0 | 0 | 0 |